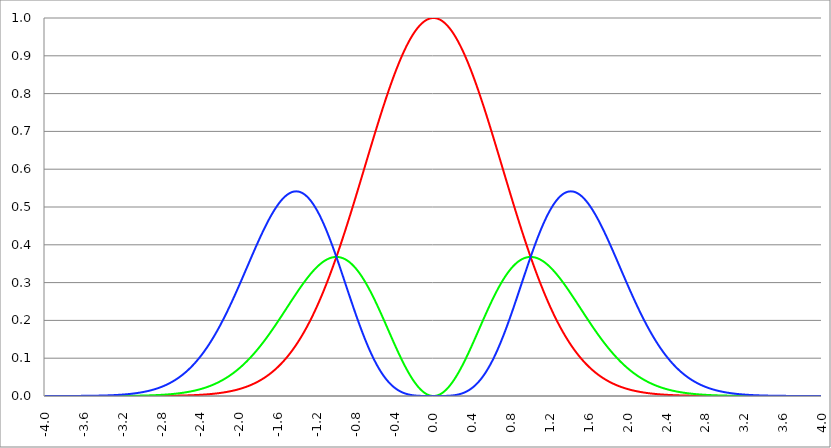
| Category | Series 1 | Series 0 | Series 2 |
|---|---|---|---|
| -4.0 | 0 | 0 | 0 |
| -3.996 | 0 | 0 | 0 |
| -3.992 | 0 | 0 | 0 |
| -3.988 | 0 | 0 | 0 |
| -3.984 | 0 | 0 | 0 |
| -3.98 | 0 | 0 | 0 |
| -3.976 | 0 | 0 | 0 |
| -3.972 | 0 | 0 | 0 |
| -3.968 | 0 | 0 | 0 |
| -3.964 | 0 | 0 | 0 |
| -3.96 | 0 | 0 | 0 |
| -3.956 | 0 | 0 | 0 |
| -3.952 | 0 | 0 | 0 |
| -3.948 | 0 | 0 | 0 |
| -3.944 | 0 | 0 | 0 |
| -3.94 | 0 | 0 | 0 |
| -3.936 | 0 | 0 | 0 |
| -3.932 | 0 | 0 | 0 |
| -3.928 | 0 | 0 | 0 |
| -3.924 | 0 | 0 | 0 |
| -3.92 | 0 | 0 | 0 |
| -3.916 | 0 | 0 | 0 |
| -3.912 | 0 | 0 | 0 |
| -3.908 | 0 | 0 | 0 |
| -3.904 | 0 | 0 | 0 |
| -3.9 | 0 | 0 | 0 |
| -3.896 | 0 | 0 | 0 |
| -3.892 | 0 | 0 | 0 |
| -3.888 | 0 | 0 | 0 |
| -3.884 | 0 | 0 | 0 |
| -3.88 | 0 | 0 | 0 |
| -3.876 | 0 | 0 | 0 |
| -3.872 | 0 | 0 | 0 |
| -3.868 | 0 | 0 | 0 |
| -3.864 | 0 | 0 | 0 |
| -3.86 | 0 | 0 | 0 |
| -3.856 | 0 | 0 | 0 |
| -3.852 | 0 | 0 | 0 |
| -3.848 | 0 | 0 | 0 |
| -3.844 | 0 | 0 | 0 |
| -3.84 | 0 | 0 | 0 |
| -3.836 | 0 | 0 | 0 |
| -3.832 | 0 | 0 | 0 |
| -3.828 | 0 | 0 | 0 |
| -3.824 | 0 | 0 | 0 |
| -3.82 | 0 | 0 | 0 |
| -3.816 | 0 | 0 | 0 |
| -3.812 | 0 | 0 | 0 |
| -3.808 | 0 | 0 | 0 |
| -3.804 | 0 | 0 | 0 |
| -3.8 | 0 | 0 | 0 |
| -3.796 | 0 | 0 | 0 |
| -3.792 | 0 | 0 | 0 |
| -3.788 | 0 | 0 | 0 |
| -3.784 | 0 | 0 | 0 |
| -3.78 | 0 | 0 | 0 |
| -3.776 | 0 | 0 | 0 |
| -3.772 | 0 | 0 | 0 |
| -3.768 | 0 | 0 | 0 |
| -3.764 | 0 | 0 | 0 |
| -3.76 | 0 | 0 | 0 |
| -3.756 | 0 | 0 | 0 |
| -3.752 | 0 | 0 | 0 |
| -3.748 | 0 | 0 | 0 |
| -3.744 | 0 | 0 | 0 |
| -3.74 | 0 | 0 | 0 |
| -3.736 | 0 | 0 | 0 |
| -3.732 | 0 | 0 | 0 |
| -3.728 | 0 | 0 | 0 |
| -3.724 | 0 | 0 | 0 |
| -3.72 | 0 | 0 | 0 |
| -3.716 | 0 | 0 | 0 |
| -3.712 | 0 | 0 | 0 |
| -3.708 | 0 | 0 | 0 |
| -3.704 | 0 | 0 | 0 |
| -3.7 | 0 | 0 | 0 |
| -3.696 | 0 | 0 | 0 |
| -3.692 | 0 | 0 | 0 |
| -3.688 | 0 | 0 | 0 |
| -3.684 | 0 | 0 | 0 |
| -3.68 | 0 | 0 | 0 |
| -3.676 | 0 | 0 | 0 |
| -3.672 | 0 | 0 | 0 |
| -3.668 | 0 | 0 | 0 |
| -3.664 | 0 | 0 | 0 |
| -3.66 | 0 | 0 | 0 |
| -3.656 | 0 | 0 | 0 |
| -3.652 | 0 | 0 | 0 |
| -3.648 | 0 | 0 | 0 |
| -3.644 | 0 | 0 | 0 |
| -3.64 | 0 | 0 | 0 |
| -3.636 | 0 | 0 | 0 |
| -3.632 | 0 | 0 | 0 |
| -3.628 | 0 | 0 | 0 |
| -3.624 | 0 | 0 | 0 |
| -3.62 | 0 | 0 | 0 |
| -3.616 | 0 | 0 | 0 |
| -3.612 | 0 | 0 | 0 |
| -3.608 | 0 | 0 | 0 |
| -3.604 | 0 | 0 | 0 |
| -3.6 | 0 | 0 | 0 |
| -3.596 | 0 | 0 | 0 |
| -3.592 | 0 | 0 | 0 |
| -3.588 | 0 | 0 | 0 |
| -3.584 | 0 | 0 | 0 |
| -3.58 | 0 | 0 | 0 |
| -3.576 | 0 | 0 | 0 |
| -3.572 | 0 | 0 | 0 |
| -3.568 | 0 | 0 | 0 |
| -3.564 | 0 | 0 | 0 |
| -3.56 | 0 | 0 | 0.001 |
| -3.556 | 0 | 0 | 0.001 |
| -3.552 | 0 | 0 | 0.001 |
| -3.548 | 0 | 0 | 0.001 |
| -3.544 | 0 | 0 | 0.001 |
| -3.54 | 0 | 0 | 0.001 |
| -3.536 | 0 | 0 | 0.001 |
| -3.532 | 0 | 0 | 0.001 |
| -3.528 | 0 | 0 | 0.001 |
| -3.524 | 0 | 0 | 0.001 |
| -3.52 | 0 | 0 | 0.001 |
| -3.516 | 0 | 0 | 0.001 |
| -3.512 | 0 | 0 | 0.001 |
| -3.508 | 0 | 0 | 0.001 |
| -3.504 | 0 | 0 | 0.001 |
| -3.5 | 0 | 0 | 0.001 |
| -3.496 | 0 | 0 | 0.001 |
| -3.492 | 0 | 0 | 0.001 |
| -3.488 | 0 | 0 | 0.001 |
| -3.484 | 0 | 0 | 0.001 |
| -3.48 | 0 | 0 | 0.001 |
| -3.476 | 0 | 0 | 0.001 |
| -3.472 | 0 | 0 | 0.001 |
| -3.467999999999999 | 0 | 0 | 0.001 |
| -3.463999999999999 | 0 | 0 | 0.001 |
| -3.459999999999999 | 0 | 0 | 0.001 |
| -3.455999999999999 | 0 | 0 | 0.001 |
| -3.451999999999999 | 0 | 0 | 0.001 |
| -3.447999999999999 | 0 | 0 | 0.001 |
| -3.443999999999999 | 0 | 0 | 0.001 |
| -3.439999999999999 | 0 | 0 | 0.001 |
| -3.435999999999999 | 0 | 0 | 0.001 |
| -3.431999999999999 | 0 | 0 | 0.001 |
| -3.427999999999999 | 0 | 0 | 0.001 |
| -3.423999999999999 | 0 | 0 | 0.001 |
| -3.419999999999999 | 0 | 0 | 0.001 |
| -3.415999999999999 | 0 | 0 | 0.001 |
| -3.411999999999999 | 0 | 0 | 0.001 |
| -3.407999999999999 | 0 | 0 | 0.001 |
| -3.403999999999999 | 0 | 0 | 0.001 |
| -3.399999999999999 | 0 | 0 | 0.001 |
| -3.395999999999999 | 0 | 0 | 0.001 |
| -3.391999999999999 | 0 | 0 | 0.001 |
| -3.387999999999999 | 0 | 0 | 0.001 |
| -3.383999999999999 | 0 | 0 | 0.001 |
| -3.379999999999999 | 0 | 0 | 0.001 |
| -3.375999999999999 | 0 | 0 | 0.001 |
| -3.371999999999999 | 0 | 0 | 0.001 |
| -3.367999999999999 | 0 | 0 | 0.002 |
| -3.363999999999999 | 0 | 0 | 0.002 |
| -3.359999999999999 | 0 | 0 | 0.002 |
| -3.355999999999999 | 0 | 0 | 0.002 |
| -3.351999999999999 | 0 | 0 | 0.002 |
| -3.347999999999999 | 0 | 0 | 0.002 |
| -3.343999999999999 | 0 | 0 | 0.002 |
| -3.339999999999999 | 0 | 0 | 0.002 |
| -3.335999999999999 | 0 | 0 | 0.002 |
| -3.331999999999999 | 0 | 0 | 0.002 |
| -3.327999999999999 | 0 | 0 | 0.002 |
| -3.323999999999999 | 0 | 0 | 0.002 |
| -3.319999999999999 | 0 | 0 | 0.002 |
| -3.315999999999999 | 0 | 0 | 0.002 |
| -3.311999999999999 | 0 | 0 | 0.002 |
| -3.307999999999999 | 0 | 0 | 0.002 |
| -3.303999999999999 | 0 | 0 | 0.002 |
| -3.299999999999999 | 0 | 0 | 0.002 |
| -3.295999999999999 | 0 | 0 | 0.002 |
| -3.291999999999999 | 0 | 0 | 0.002 |
| -3.288 | 0 | 0 | 0.002 |
| -3.284 | 0 | 0 | 0.002 |
| -3.279999999999999 | 0 | 0 | 0.002 |
| -3.275999999999999 | 0 | 0 | 0.003 |
| -3.271999999999999 | 0 | 0 | 0.003 |
| -3.268 | 0 | 0 | 0.003 |
| -3.264 | 0 | 0 | 0.003 |
| -3.259999999999999 | 0 | 0 | 0.003 |
| -3.255999999999999 | 0 | 0 | 0.003 |
| -3.251999999999999 | 0 | 0 | 0.003 |
| -3.248 | 0 | 0 | 0.003 |
| -3.244 | 0 | 0 | 0.003 |
| -3.239999999999999 | 0 | 0 | 0.003 |
| -3.235999999999999 | 0 | 0 | 0.003 |
| -3.231999999999999 | 0 | 0 | 0.003 |
| -3.228 | 0 | 0 | 0.003 |
| -3.224 | 0 | 0 | 0.003 |
| -3.219999999999999 | 0 | 0 | 0.003 |
| -3.215999999999999 | 0 | 0 | 0.003 |
| -3.211999999999999 | 0 | 0 | 0.004 |
| -3.208 | 0 | 0 | 0.004 |
| -3.204 | 0 | 0 | 0.004 |
| -3.199999999999999 | 0 | 0 | 0.004 |
| -3.195999999999999 | 0 | 0 | 0.004 |
| -3.191999999999999 | 0 | 0 | 0.004 |
| -3.188 | 0 | 0 | 0.004 |
| -3.184 | 0 | 0 | 0.004 |
| -3.179999999999999 | 0 | 0 | 0.004 |
| -3.175999999999999 | 0 | 0 | 0.004 |
| -3.171999999999999 | 0 | 0 | 0.004 |
| -3.168 | 0 | 0 | 0.004 |
| -3.164 | 0 | 0 | 0.005 |
| -3.159999999999999 | 0 | 0 | 0.005 |
| -3.155999999999999 | 0 | 0 | 0.005 |
| -3.151999999999999 | 0 | 0 | 0.005 |
| -3.148 | 0 | 0 | 0.005 |
| -3.144 | 0 | 0.001 | 0.005 |
| -3.139999999999999 | 0 | 0.001 | 0.005 |
| -3.135999999999999 | 0 | 0.001 | 0.005 |
| -3.131999999999999 | 0 | 0.001 | 0.005 |
| -3.128 | 0 | 0.001 | 0.005 |
| -3.124 | 0 | 0.001 | 0.006 |
| -3.119999999999999 | 0 | 0.001 | 0.006 |
| -3.115999999999999 | 0 | 0.001 | 0.006 |
| -3.111999999999999 | 0 | 0.001 | 0.006 |
| -3.108 | 0 | 0.001 | 0.006 |
| -3.104 | 0 | 0.001 | 0.006 |
| -3.099999999999999 | 0 | 0.001 | 0.006 |
| -3.095999999999999 | 0 | 0.001 | 0.006 |
| -3.091999999999999 | 0 | 0.001 | 0.006 |
| -3.088 | 0 | 0.001 | 0.007 |
| -3.084 | 0 | 0.001 | 0.007 |
| -3.079999999999999 | 0 | 0.001 | 0.007 |
| -3.075999999999999 | 0 | 0.001 | 0.007 |
| -3.071999999999999 | 0 | 0.001 | 0.007 |
| -3.068 | 0 | 0.001 | 0.007 |
| -3.064 | 0 | 0.001 | 0.007 |
| -3.059999999999999 | 0 | 0.001 | 0.008 |
| -3.055999999999999 | 0 | 0.001 | 0.008 |
| -3.051999999999999 | 0 | 0.001 | 0.008 |
| -3.048 | 0 | 0.001 | 0.008 |
| -3.044 | 0 | 0.001 | 0.008 |
| -3.039999999999999 | 0 | 0.001 | 0.008 |
| -3.035999999999999 | 0 | 0.001 | 0.008 |
| -3.031999999999999 | 0 | 0.001 | 0.009 |
| -3.028 | 0 | 0.001 | 0.009 |
| -3.024 | 0 | 0.001 | 0.009 |
| -3.019999999999999 | 0 | 0.001 | 0.009 |
| -3.015999999999999 | 0 | 0.001 | 0.009 |
| -3.011999999999999 | 0 | 0.001 | 0.009 |
| -3.008 | 0 | 0.001 | 0.01 |
| -3.004 | 0 | 0.001 | 0.01 |
| -2.999999999999999 | 0 | 0.001 | 0.01 |
| -2.995999999999999 | 0 | 0.001 | 0.01 |
| -2.991999999999999 | 0 | 0.001 | 0.01 |
| -2.988 | 0 | 0.001 | 0.011 |
| -2.984 | 0 | 0.001 | 0.011 |
| -2.979999999999999 | 0 | 0.001 | 0.011 |
| -2.975999999999999 | 0 | 0.001 | 0.011 |
| -2.971999999999999 | 0 | 0.001 | 0.011 |
| -2.968 | 0 | 0.001 | 0.012 |
| -2.964 | 0 | 0.001 | 0.012 |
| -2.959999999999999 | 0 | 0.001 | 0.012 |
| -2.955999999999999 | 0 | 0.001 | 0.012 |
| -2.951999999999999 | 0 | 0.001 | 0.012 |
| -2.948 | 0 | 0.001 | 0.013 |
| -2.944 | 0 | 0.001 | 0.013 |
| -2.939999999999999 | 0 | 0.002 | 0.013 |
| -2.935999999999999 | 0 | 0.002 | 0.013 |
| -2.931999999999999 | 0 | 0.002 | 0.014 |
| -2.928 | 0 | 0.002 | 0.014 |
| -2.924 | 0 | 0.002 | 0.014 |
| -2.919999999999999 | 0 | 0.002 | 0.014 |
| -2.915999999999999 | 0 | 0.002 | 0.015 |
| -2.911999999999999 | 0 | 0.002 | 0.015 |
| -2.908 | 0 | 0.002 | 0.015 |
| -2.904 | 0 | 0.002 | 0.015 |
| -2.899999999999999 | 0 | 0.002 | 0.016 |
| -2.895999999999999 | 0 | 0.002 | 0.016 |
| -2.891999999999999 | 0 | 0.002 | 0.016 |
| -2.887999999999999 | 0 | 0.002 | 0.017 |
| -2.883999999999999 | 0 | 0.002 | 0.017 |
| -2.879999999999999 | 0 | 0.002 | 0.017 |
| -2.875999999999999 | 0 | 0.002 | 0.017 |
| -2.871999999999999 | 0 | 0.002 | 0.018 |
| -2.867999999999999 | 0 | 0.002 | 0.018 |
| -2.863999999999999 | 0 | 0.002 | 0.018 |
| -2.859999999999999 | 0 | 0.002 | 0.019 |
| -2.855999999999999 | 0 | 0.002 | 0.019 |
| -2.851999999999999 | 0 | 0.002 | 0.019 |
| -2.847999999999999 | 0 | 0.002 | 0.02 |
| -2.843999999999999 | 0 | 0.002 | 0.02 |
| -2.839999999999999 | 0 | 0.003 | 0.02 |
| -2.835999999999999 | 0 | 0.003 | 0.021 |
| -2.831999999999999 | 0 | 0.003 | 0.021 |
| -2.827999999999999 | 0 | 0.003 | 0.022 |
| -2.823999999999999 | 0 | 0.003 | 0.022 |
| -2.819999999999999 | 0 | 0.003 | 0.022 |
| -2.815999999999999 | 0 | 0.003 | 0.023 |
| -2.811999999999999 | 0 | 0.003 | 0.023 |
| -2.807999999999999 | 0 | 0.003 | 0.023 |
| -2.803999999999999 | 0 | 0.003 | 0.024 |
| -2.799999999999999 | 0 | 0.003 | 0.024 |
| -2.795999999999999 | 0 | 0.003 | 0.025 |
| -2.791999999999999 | 0 | 0.003 | 0.025 |
| -2.787999999999999 | 0 | 0.003 | 0.025 |
| -2.783999999999999 | 0 | 0.003 | 0.026 |
| -2.779999999999999 | 0 | 0.003 | 0.026 |
| -2.775999999999999 | 0 | 0.003 | 0.027 |
| -2.771999999999999 | 0 | 0.004 | 0.027 |
| -2.767999999999999 | 0 | 0.004 | 0.028 |
| -2.763999999999999 | 0 | 0.004 | 0.028 |
| -2.759999999999999 | 0 | 0.004 | 0.029 |
| -2.755999999999999 | 0.001 | 0.004 | 0.029 |
| -2.751999999999999 | 0.001 | 0.004 | 0.029 |
| -2.747999999999999 | 0.001 | 0.004 | 0.03 |
| -2.743999999999999 | 0.001 | 0.004 | 0.03 |
| -2.739999999999999 | 0.001 | 0.004 | 0.031 |
| -2.735999999999999 | 0.001 | 0.004 | 0.031 |
| -2.731999999999999 | 0.001 | 0.004 | 0.032 |
| -2.727999999999999 | 0.001 | 0.004 | 0.032 |
| -2.723999999999999 | 0.001 | 0.004 | 0.033 |
| -2.719999999999999 | 0.001 | 0.005 | 0.034 |
| -2.715999999999999 | 0.001 | 0.005 | 0.034 |
| -2.711999999999999 | 0.001 | 0.005 | 0.035 |
| -2.707999999999999 | 0.001 | 0.005 | 0.035 |
| -2.703999999999999 | 0.001 | 0.005 | 0.036 |
| -2.699999999999999 | 0.001 | 0.005 | 0.036 |
| -2.695999999999999 | 0.001 | 0.005 | 0.037 |
| -2.691999999999999 | 0.001 | 0.005 | 0.037 |
| -2.687999999999999 | 0.001 | 0.005 | 0.038 |
| -2.683999999999999 | 0.001 | 0.005 | 0.039 |
| -2.679999999999999 | 0.001 | 0.005 | 0.039 |
| -2.675999999999999 | 0.001 | 0.006 | 0.04 |
| -2.671999999999999 | 0.001 | 0.006 | 0.04 |
| -2.667999999999999 | 0.001 | 0.006 | 0.041 |
| -2.663999999999999 | 0.001 | 0.006 | 0.042 |
| -2.659999999999999 | 0.001 | 0.006 | 0.042 |
| -2.655999999999999 | 0.001 | 0.006 | 0.043 |
| -2.651999999999999 | 0.001 | 0.006 | 0.044 |
| -2.647999999999999 | 0.001 | 0.006 | 0.044 |
| -2.643999999999999 | 0.001 | 0.006 | 0.045 |
| -2.639999999999999 | 0.001 | 0.007 | 0.046 |
| -2.635999999999999 | 0.001 | 0.007 | 0.046 |
| -2.631999999999999 | 0.001 | 0.007 | 0.047 |
| -2.627999999999999 | 0.001 | 0.007 | 0.048 |
| -2.623999999999999 | 0.001 | 0.007 | 0.048 |
| -2.619999999999999 | 0.001 | 0.007 | 0.049 |
| -2.615999999999999 | 0.001 | 0.007 | 0.05 |
| -2.611999999999999 | 0.001 | 0.007 | 0.051 |
| -2.607999999999999 | 0.001 | 0.008 | 0.051 |
| -2.603999999999999 | 0.001 | 0.008 | 0.052 |
| -2.599999999999999 | 0.001 | 0.008 | 0.053 |
| -2.595999999999999 | 0.001 | 0.008 | 0.054 |
| -2.591999999999999 | 0.001 | 0.008 | 0.055 |
| -2.587999999999999 | 0.001 | 0.008 | 0.055 |
| -2.583999999999999 | 0.001 | 0.008 | 0.056 |
| -2.579999999999999 | 0.001 | 0.009 | 0.057 |
| -2.575999999999999 | 0.001 | 0.009 | 0.058 |
| -2.571999999999999 | 0.001 | 0.009 | 0.059 |
| -2.567999999999999 | 0.001 | 0.009 | 0.059 |
| -2.563999999999999 | 0.001 | 0.009 | 0.06 |
| -2.559999999999999 | 0.001 | 0.009 | 0.061 |
| -2.555999999999999 | 0.001 | 0.01 | 0.062 |
| -2.551999999999999 | 0.001 | 0.01 | 0.063 |
| -2.547999999999999 | 0.002 | 0.01 | 0.064 |
| -2.543999999999999 | 0.002 | 0.01 | 0.065 |
| -2.539999999999999 | 0.002 | 0.01 | 0.066 |
| -2.535999999999999 | 0.002 | 0.01 | 0.067 |
| -2.531999999999999 | 0.002 | 0.011 | 0.068 |
| -2.527999999999999 | 0.002 | 0.011 | 0.068 |
| -2.523999999999999 | 0.002 | 0.011 | 0.069 |
| -2.519999999999999 | 0.002 | 0.011 | 0.07 |
| -2.515999999999999 | 0.002 | 0.011 | 0.071 |
| -2.511999999999999 | 0.002 | 0.011 | 0.072 |
| -2.507999999999999 | 0.002 | 0.012 | 0.073 |
| -2.503999999999999 | 0.002 | 0.012 | 0.074 |
| -2.499999999999999 | 0.002 | 0.012 | 0.075 |
| -2.495999999999999 | 0.002 | 0.012 | 0.076 |
| -2.491999999999999 | 0.002 | 0.012 | 0.077 |
| -2.487999999999999 | 0.002 | 0.013 | 0.079 |
| -2.483999999999999 | 0.002 | 0.013 | 0.08 |
| -2.479999999999999 | 0.002 | 0.013 | 0.081 |
| -2.475999999999999 | 0.002 | 0.013 | 0.082 |
| -2.471999999999999 | 0.002 | 0.014 | 0.083 |
| -2.467999999999999 | 0.002 | 0.014 | 0.084 |
| -2.463999999999999 | 0.002 | 0.014 | 0.085 |
| -2.459999999999999 | 0.002 | 0.014 | 0.086 |
| -2.455999999999999 | 0.002 | 0.014 | 0.087 |
| -2.451999999999999 | 0.002 | 0.015 | 0.089 |
| -2.447999999999999 | 0.002 | 0.015 | 0.09 |
| -2.443999999999999 | 0.003 | 0.015 | 0.091 |
| -2.439999999999999 | 0.003 | 0.015 | 0.092 |
| -2.435999999999999 | 0.003 | 0.016 | 0.093 |
| -2.431999999999999 | 0.003 | 0.016 | 0.094 |
| -2.427999999999999 | 0.003 | 0.016 | 0.096 |
| -2.423999999999999 | 0.003 | 0.016 | 0.097 |
| -2.419999999999999 | 0.003 | 0.017 | 0.098 |
| -2.415999999999999 | 0.003 | 0.017 | 0.099 |
| -2.411999999999999 | 0.003 | 0.017 | 0.101 |
| -2.407999999999999 | 0.003 | 0.018 | 0.102 |
| -2.403999999999999 | 0.003 | 0.018 | 0.103 |
| -2.399999999999999 | 0.003 | 0.018 | 0.105 |
| -2.395999999999999 | 0.003 | 0.018 | 0.106 |
| -2.391999999999999 | 0.003 | 0.019 | 0.107 |
| -2.387999999999999 | 0.003 | 0.019 | 0.109 |
| -2.383999999999999 | 0.003 | 0.019 | 0.11 |
| -2.379999999999999 | 0.003 | 0.02 | 0.111 |
| -2.375999999999999 | 0.004 | 0.02 | 0.113 |
| -2.371999999999999 | 0.004 | 0.02 | 0.114 |
| -2.367999999999998 | 0.004 | 0.021 | 0.115 |
| -2.363999999999998 | 0.004 | 0.021 | 0.117 |
| -2.359999999999998 | 0.004 | 0.021 | 0.118 |
| -2.355999999999998 | 0.004 | 0.022 | 0.12 |
| -2.351999999999998 | 0.004 | 0.022 | 0.121 |
| -2.347999999999998 | 0.004 | 0.022 | 0.123 |
| -2.343999999999998 | 0.004 | 0.023 | 0.124 |
| -2.339999999999998 | 0.004 | 0.023 | 0.126 |
| -2.335999999999998 | 0.004 | 0.023 | 0.127 |
| -2.331999999999998 | 0.004 | 0.024 | 0.129 |
| -2.327999999999998 | 0.004 | 0.024 | 0.13 |
| -2.323999999999998 | 0.005 | 0.024 | 0.132 |
| -2.319999999999998 | 0.005 | 0.025 | 0.133 |
| -2.315999999999998 | 0.005 | 0.025 | 0.135 |
| -2.311999999999998 | 0.005 | 0.025 | 0.136 |
| -2.307999999999998 | 0.005 | 0.026 | 0.138 |
| -2.303999999999998 | 0.005 | 0.026 | 0.139 |
| -2.299999999999998 | 0.005 | 0.027 | 0.141 |
| -2.295999999999998 | 0.005 | 0.027 | 0.143 |
| -2.291999999999998 | 0.005 | 0.027 | 0.144 |
| -2.287999999999998 | 0.005 | 0.028 | 0.146 |
| -2.283999999999998 | 0.005 | 0.028 | 0.148 |
| -2.279999999999998 | 0.006 | 0.029 | 0.149 |
| -2.275999999999998 | 0.006 | 0.029 | 0.151 |
| -2.271999999999998 | 0.006 | 0.03 | 0.153 |
| -2.267999999999998 | 0.006 | 0.03 | 0.154 |
| -2.263999999999998 | 0.006 | 0.03 | 0.156 |
| -2.259999999999998 | 0.006 | 0.031 | 0.158 |
| -2.255999999999998 | 0.006 | 0.031 | 0.16 |
| -2.251999999999998 | 0.006 | 0.032 | 0.161 |
| -2.247999999999998 | 0.006 | 0.032 | 0.163 |
| -2.243999999999998 | 0.007 | 0.033 | 0.165 |
| -2.239999999999998 | 0.007 | 0.033 | 0.167 |
| -2.235999999999998 | 0.007 | 0.034 | 0.168 |
| -2.231999999999998 | 0.007 | 0.034 | 0.17 |
| -2.227999999999998 | 0.007 | 0.035 | 0.172 |
| -2.223999999999998 | 0.007 | 0.035 | 0.174 |
| -2.219999999999998 | 0.007 | 0.036 | 0.176 |
| -2.215999999999998 | 0.007 | 0.036 | 0.178 |
| -2.211999999999998 | 0.007 | 0.037 | 0.18 |
| -2.207999999999998 | 0.008 | 0.037 | 0.181 |
| -2.203999999999998 | 0.008 | 0.038 | 0.183 |
| -2.199999999999998 | 0.008 | 0.038 | 0.185 |
| -2.195999999999998 | 0.008 | 0.039 | 0.187 |
| -2.191999999999998 | 0.008 | 0.039 | 0.189 |
| -2.187999999999998 | 0.008 | 0.04 | 0.191 |
| -2.183999999999998 | 0.008 | 0.04 | 0.193 |
| -2.179999999999998 | 0.009 | 0.041 | 0.195 |
| -2.175999999999998 | 0.009 | 0.042 | 0.197 |
| -2.171999999999998 | 0.009 | 0.042 | 0.199 |
| -2.167999999999998 | 0.009 | 0.043 | 0.201 |
| -2.163999999999998 | 0.009 | 0.043 | 0.203 |
| -2.159999999999998 | 0.009 | 0.044 | 0.205 |
| -2.155999999999998 | 0.01 | 0.045 | 0.207 |
| -2.151999999999998 | 0.01 | 0.045 | 0.209 |
| -2.147999999999998 | 0.01 | 0.046 | 0.211 |
| -2.143999999999998 | 0.01 | 0.046 | 0.213 |
| -2.139999999999998 | 0.01 | 0.047 | 0.215 |
| -2.135999999999998 | 0.01 | 0.048 | 0.217 |
| -2.131999999999998 | 0.011 | 0.048 | 0.219 |
| -2.127999999999998 | 0.011 | 0.049 | 0.221 |
| -2.123999999999998 | 0.011 | 0.05 | 0.224 |
| -2.119999999999998 | 0.011 | 0.05 | 0.226 |
| -2.115999999999998 | 0.011 | 0.051 | 0.228 |
| -2.111999999999998 | 0.012 | 0.052 | 0.23 |
| -2.107999999999998 | 0.012 | 0.052 | 0.232 |
| -2.103999999999998 | 0.012 | 0.053 | 0.234 |
| -2.099999999999998 | 0.012 | 0.054 | 0.236 |
| -2.095999999999998 | 0.012 | 0.054 | 0.239 |
| -2.091999999999998 | 0.013 | 0.055 | 0.241 |
| -2.087999999999998 | 0.013 | 0.056 | 0.243 |
| -2.083999999999998 | 0.013 | 0.056 | 0.245 |
| -2.079999999999998 | 0.013 | 0.057 | 0.247 |
| -2.075999999999998 | 0.013 | 0.058 | 0.25 |
| -2.071999999999998 | 0.014 | 0.059 | 0.252 |
| -2.067999999999998 | 0.014 | 0.059 | 0.254 |
| -2.063999999999998 | 0.014 | 0.06 | 0.256 |
| -2.059999999999998 | 0.014 | 0.061 | 0.259 |
| -2.055999999999998 | 0.015 | 0.062 | 0.261 |
| -2.051999999999998 | 0.015 | 0.062 | 0.263 |
| -2.047999999999998 | 0.015 | 0.063 | 0.265 |
| -2.043999999999998 | 0.015 | 0.064 | 0.268 |
| -2.039999999999998 | 0.016 | 0.065 | 0.27 |
| -2.035999999999998 | 0.016 | 0.066 | 0.272 |
| -2.031999999999998 | 0.016 | 0.066 | 0.274 |
| -2.027999999999998 | 0.016 | 0.067 | 0.277 |
| -2.023999999999998 | 0.017 | 0.068 | 0.279 |
| -2.019999999999998 | 0.017 | 0.069 | 0.281 |
| -2.015999999999998 | 0.017 | 0.07 | 0.284 |
| -2.011999999999998 | 0.017 | 0.071 | 0.286 |
| -2.007999999999998 | 0.018 | 0.072 | 0.288 |
| -2.003999999999998 | 0.018 | 0.072 | 0.291 |
| -1.999999999999998 | 0.018 | 0.073 | 0.293 |
| -1.995999999999998 | 0.019 | 0.074 | 0.295 |
| -1.991999999999998 | 0.019 | 0.075 | 0.298 |
| -1.987999999999998 | 0.019 | 0.076 | 0.3 |
| -1.983999999999998 | 0.02 | 0.077 | 0.302 |
| -1.979999999999998 | 0.02 | 0.078 | 0.305 |
| -1.975999999999998 | 0.02 | 0.079 | 0.307 |
| -1.971999999999998 | 0.02 | 0.08 | 0.31 |
| -1.967999999999998 | 0.021 | 0.081 | 0.312 |
| -1.963999999999998 | 0.021 | 0.081 | 0.314 |
| -1.959999999999998 | 0.021 | 0.082 | 0.317 |
| -1.955999999999998 | 0.022 | 0.083 | 0.319 |
| -1.951999999999998 | 0.022 | 0.084 | 0.321 |
| -1.947999999999998 | 0.022 | 0.085 | 0.324 |
| -1.943999999999998 | 0.023 | 0.086 | 0.326 |
| -1.939999999999998 | 0.023 | 0.087 | 0.329 |
| -1.935999999999998 | 0.024 | 0.088 | 0.331 |
| -1.931999999999998 | 0.024 | 0.089 | 0.333 |
| -1.927999999999998 | 0.024 | 0.09 | 0.336 |
| -1.923999999999998 | 0.025 | 0.091 | 0.338 |
| -1.919999999999998 | 0.025 | 0.092 | 0.341 |
| -1.915999999999998 | 0.025 | 0.093 | 0.343 |
| -1.911999999999998 | 0.026 | 0.094 | 0.345 |
| -1.907999999999998 | 0.026 | 0.096 | 0.348 |
| -1.903999999999998 | 0.027 | 0.097 | 0.35 |
| -1.899999999999998 | 0.027 | 0.098 | 0.353 |
| -1.895999999999998 | 0.027 | 0.099 | 0.355 |
| -1.891999999999998 | 0.028 | 0.1 | 0.357 |
| -1.887999999999998 | 0.028 | 0.101 | 0.36 |
| -1.883999999999998 | 0.029 | 0.102 | 0.362 |
| -1.879999999999998 | 0.029 | 0.103 | 0.364 |
| -1.875999999999998 | 0.03 | 0.104 | 0.367 |
| -1.871999999999998 | 0.03 | 0.105 | 0.369 |
| -1.867999999999998 | 0.031 | 0.106 | 0.372 |
| -1.863999999999998 | 0.031 | 0.108 | 0.374 |
| -1.859999999999998 | 0.031 | 0.109 | 0.376 |
| -1.855999999999998 | 0.032 | 0.11 | 0.379 |
| -1.851999999999998 | 0.032 | 0.111 | 0.381 |
| -1.847999999999998 | 0.033 | 0.112 | 0.383 |
| -1.843999999999998 | 0.033 | 0.113 | 0.386 |
| -1.839999999999998 | 0.034 | 0.115 | 0.388 |
| -1.835999999999998 | 0.034 | 0.116 | 0.39 |
| -1.831999999999998 | 0.035 | 0.117 | 0.393 |
| -1.827999999999998 | 0.035 | 0.118 | 0.395 |
| -1.823999999999998 | 0.036 | 0.119 | 0.397 |
| -1.819999999999998 | 0.036 | 0.121 | 0.4 |
| -1.815999999999998 | 0.037 | 0.122 | 0.402 |
| -1.811999999999998 | 0.038 | 0.123 | 0.404 |
| -1.807999999999998 | 0.038 | 0.124 | 0.407 |
| -1.803999999999998 | 0.039 | 0.126 | 0.409 |
| -1.799999999999998 | 0.039 | 0.127 | 0.411 |
| -1.795999999999998 | 0.04 | 0.128 | 0.413 |
| -1.791999999999998 | 0.04 | 0.129 | 0.416 |
| -1.787999999999998 | 0.041 | 0.131 | 0.418 |
| -1.783999999999998 | 0.041 | 0.132 | 0.42 |
| -1.779999999999998 | 0.042 | 0.133 | 0.422 |
| -1.775999999999998 | 0.043 | 0.135 | 0.425 |
| -1.771999999999998 | 0.043 | 0.136 | 0.427 |
| -1.767999999999998 | 0.044 | 0.137 | 0.429 |
| -1.763999999999998 | 0.045 | 0.139 | 0.431 |
| -1.759999999999998 | 0.045 | 0.14 | 0.433 |
| -1.755999999999998 | 0.046 | 0.141 | 0.435 |
| -1.751999999999998 | 0.046 | 0.143 | 0.438 |
| -1.747999999999998 | 0.047 | 0.144 | 0.44 |
| -1.743999999999998 | 0.048 | 0.145 | 0.442 |
| -1.739999999999998 | 0.048 | 0.147 | 0.444 |
| -1.735999999999998 | 0.049 | 0.148 | 0.446 |
| -1.731999999999998 | 0.05 | 0.149 | 0.448 |
| -1.727999999999998 | 0.05 | 0.151 | 0.45 |
| -1.723999999999998 | 0.051 | 0.152 | 0.452 |
| -1.719999999999998 | 0.052 | 0.154 | 0.454 |
| -1.715999999999998 | 0.053 | 0.155 | 0.456 |
| -1.711999999999998 | 0.053 | 0.156 | 0.458 |
| -1.707999999999998 | 0.054 | 0.158 | 0.46 |
| -1.703999999999998 | 0.055 | 0.159 | 0.462 |
| -1.699999999999998 | 0.056 | 0.161 | 0.464 |
| -1.695999999999998 | 0.056 | 0.162 | 0.466 |
| -1.691999999999998 | 0.057 | 0.163 | 0.468 |
| -1.687999999999998 | 0.058 | 0.165 | 0.47 |
| -1.683999999999998 | 0.059 | 0.166 | 0.472 |
| -1.679999999999998 | 0.059 | 0.168 | 0.474 |
| -1.675999999999998 | 0.06 | 0.169 | 0.476 |
| -1.671999999999998 | 0.061 | 0.171 | 0.477 |
| -1.667999999999998 | 0.062 | 0.172 | 0.479 |
| -1.663999999999998 | 0.063 | 0.174 | 0.481 |
| -1.659999999999998 | 0.064 | 0.175 | 0.483 |
| -1.655999999999998 | 0.064 | 0.177 | 0.484 |
| -1.651999999999998 | 0.065 | 0.178 | 0.486 |
| -1.647999999999998 | 0.066 | 0.18 | 0.488 |
| -1.643999999999998 | 0.067 | 0.181 | 0.49 |
| -1.639999999999998 | 0.068 | 0.183 | 0.491 |
| -1.635999999999998 | 0.069 | 0.184 | 0.493 |
| -1.631999999999998 | 0.07 | 0.186 | 0.495 |
| -1.627999999999998 | 0.071 | 0.187 | 0.496 |
| -1.623999999999998 | 0.072 | 0.189 | 0.498 |
| -1.619999999999998 | 0.072 | 0.19 | 0.499 |
| -1.615999999999998 | 0.073 | 0.192 | 0.501 |
| -1.611999999999998 | 0.074 | 0.193 | 0.502 |
| -1.607999999999998 | 0.075 | 0.195 | 0.504 |
| -1.603999999999998 | 0.076 | 0.196 | 0.505 |
| -1.599999999999998 | 0.077 | 0.198 | 0.507 |
| -1.595999999999998 | 0.078 | 0.199 | 0.508 |
| -1.591999999999998 | 0.079 | 0.201 | 0.509 |
| -1.587999999999998 | 0.08 | 0.203 | 0.511 |
| -1.583999999999998 | 0.081 | 0.204 | 0.512 |
| -1.579999999999998 | 0.082 | 0.206 | 0.513 |
| -1.575999999999998 | 0.083 | 0.207 | 0.515 |
| -1.571999999999998 | 0.084 | 0.209 | 0.516 |
| -1.567999999999998 | 0.086 | 0.21 | 0.517 |
| -1.563999999999998 | 0.087 | 0.212 | 0.518 |
| -1.559999999999998 | 0.088 | 0.213 | 0.52 |
| -1.555999999999998 | 0.089 | 0.215 | 0.521 |
| -1.551999999999998 | 0.09 | 0.217 | 0.522 |
| -1.547999999999998 | 0.091 | 0.218 | 0.523 |
| -1.543999999999998 | 0.092 | 0.22 | 0.524 |
| -1.539999999999998 | 0.093 | 0.221 | 0.525 |
| -1.535999999999998 | 0.094 | 0.223 | 0.526 |
| -1.531999999999998 | 0.096 | 0.225 | 0.527 |
| -1.527999999999998 | 0.097 | 0.226 | 0.528 |
| -1.523999999999998 | 0.098 | 0.228 | 0.529 |
| -1.519999999999998 | 0.099 | 0.229 | 0.53 |
| -1.515999999999998 | 0.1 | 0.231 | 0.53 |
| -1.511999999999998 | 0.102 | 0.232 | 0.531 |
| -1.507999999999998 | 0.103 | 0.234 | 0.532 |
| -1.503999999999998 | 0.104 | 0.236 | 0.533 |
| -1.499999999999998 | 0.105 | 0.237 | 0.534 |
| -1.495999999999998 | 0.107 | 0.239 | 0.534 |
| -1.491999999999998 | 0.108 | 0.24 | 0.535 |
| -1.487999999999998 | 0.109 | 0.242 | 0.536 |
| -1.483999999999998 | 0.111 | 0.243 | 0.536 |
| -1.479999999999998 | 0.112 | 0.245 | 0.537 |
| -1.475999999999998 | 0.113 | 0.247 | 0.537 |
| -1.471999999999998 | 0.115 | 0.248 | 0.538 |
| -1.467999999999998 | 0.116 | 0.25 | 0.538 |
| -1.463999999999998 | 0.117 | 0.251 | 0.539 |
| -1.459999999999998 | 0.119 | 0.253 | 0.539 |
| -1.455999999999998 | 0.12 | 0.254 | 0.539 |
| -1.451999999999998 | 0.121 | 0.256 | 0.54 |
| -1.447999999999998 | 0.123 | 0.258 | 0.54 |
| -1.443999999999998 | 0.124 | 0.259 | 0.54 |
| -1.439999999999998 | 0.126 | 0.261 | 0.541 |
| -1.435999999999998 | 0.127 | 0.262 | 0.541 |
| -1.431999999999998 | 0.129 | 0.264 | 0.541 |
| -1.427999999999998 | 0.13 | 0.265 | 0.541 |
| -1.423999999999998 | 0.132 | 0.267 | 0.541 |
| -1.419999999999998 | 0.133 | 0.268 | 0.541 |
| -1.415999999999998 | 0.135 | 0.27 | 0.541 |
| -1.411999999999998 | 0.136 | 0.272 | 0.541 |
| -1.407999999999998 | 0.138 | 0.273 | 0.541 |
| -1.403999999999998 | 0.139 | 0.275 | 0.541 |
| -1.399999999999998 | 0.141 | 0.276 | 0.541 |
| -1.395999999999998 | 0.142 | 0.278 | 0.541 |
| -1.391999999999998 | 0.144 | 0.279 | 0.541 |
| -1.387999999999998 | 0.146 | 0.281 | 0.541 |
| -1.383999999999998 | 0.147 | 0.282 | 0.54 |
| -1.379999999999998 | 0.149 | 0.284 | 0.54 |
| -1.375999999999998 | 0.151 | 0.285 | 0.54 |
| -1.371999999999998 | 0.152 | 0.287 | 0.539 |
| -1.367999999999998 | 0.154 | 0.288 | 0.539 |
| -1.363999999999998 | 0.156 | 0.289 | 0.539 |
| -1.359999999999998 | 0.157 | 0.291 | 0.538 |
| -1.355999999999998 | 0.159 | 0.292 | 0.538 |
| -1.351999999999998 | 0.161 | 0.294 | 0.537 |
| -1.347999999999998 | 0.162 | 0.295 | 0.537 |
| -1.343999999999998 | 0.164 | 0.297 | 0.536 |
| -1.339999999999998 | 0.166 | 0.298 | 0.535 |
| -1.335999999999998 | 0.168 | 0.3 | 0.535 |
| -1.331999999999998 | 0.17 | 0.301 | 0.534 |
| -1.327999999999998 | 0.171 | 0.302 | 0.533 |
| -1.323999999999998 | 0.173 | 0.304 | 0.532 |
| -1.319999999999998 | 0.175 | 0.305 | 0.532 |
| -1.315999999999998 | 0.177 | 0.306 | 0.531 |
| -1.311999999999998 | 0.179 | 0.308 | 0.53 |
| -1.307999999999998 | 0.181 | 0.309 | 0.529 |
| -1.303999999999998 | 0.183 | 0.311 | 0.528 |
| -1.299999999999998 | 0.185 | 0.312 | 0.527 |
| -1.295999999999998 | 0.186 | 0.313 | 0.526 |
| -1.291999999999998 | 0.188 | 0.314 | 0.525 |
| -1.287999999999998 | 0.19 | 0.316 | 0.524 |
| -1.283999999999998 | 0.192 | 0.317 | 0.523 |
| -1.279999999999998 | 0.194 | 0.318 | 0.522 |
| -1.275999999999998 | 0.196 | 0.32 | 0.52 |
| -1.271999999999998 | 0.198 | 0.321 | 0.519 |
| -1.267999999999998 | 0.2 | 0.322 | 0.518 |
| -1.263999999999998 | 0.202 | 0.323 | 0.517 |
| -1.259999999999998 | 0.204 | 0.325 | 0.515 |
| -1.255999999999998 | 0.206 | 0.326 | 0.514 |
| -1.251999999999998 | 0.209 | 0.327 | 0.512 |
| -1.247999999999998 | 0.211 | 0.328 | 0.511 |
| -1.243999999999998 | 0.213 | 0.329 | 0.51 |
| -1.239999999999998 | 0.215 | 0.33 | 0.508 |
| -1.235999999999998 | 0.217 | 0.332 | 0.507 |
| -1.231999999999998 | 0.219 | 0.333 | 0.505 |
| -1.227999999999998 | 0.221 | 0.334 | 0.503 |
| -1.223999999999998 | 0.224 | 0.335 | 0.502 |
| -1.219999999999998 | 0.226 | 0.336 | 0.5 |
| -1.215999999999998 | 0.228 | 0.337 | 0.498 |
| -1.211999999999998 | 0.23 | 0.338 | 0.497 |
| -1.207999999999998 | 0.232 | 0.339 | 0.495 |
| -1.203999999999998 | 0.235 | 0.34 | 0.493 |
| -1.199999999999997 | 0.237 | 0.341 | 0.491 |
| -1.195999999999997 | 0.239 | 0.342 | 0.489 |
| -1.191999999999997 | 0.242 | 0.343 | 0.488 |
| -1.187999999999997 | 0.244 | 0.344 | 0.486 |
| -1.183999999999997 | 0.246 | 0.345 | 0.484 |
| -1.179999999999997 | 0.248 | 0.346 | 0.482 |
| -1.175999999999997 | 0.251 | 0.347 | 0.48 |
| -1.171999999999997 | 0.253 | 0.348 | 0.478 |
| -1.167999999999997 | 0.256 | 0.349 | 0.476 |
| -1.163999999999997 | 0.258 | 0.35 | 0.474 |
| -1.159999999999997 | 0.26 | 0.35 | 0.471 |
| -1.155999999999997 | 0.263 | 0.351 | 0.469 |
| -1.151999999999997 | 0.265 | 0.352 | 0.467 |
| -1.147999999999997 | 0.268 | 0.353 | 0.465 |
| -1.143999999999997 | 0.27 | 0.354 | 0.463 |
| -1.139999999999997 | 0.273 | 0.354 | 0.46 |
| -1.135999999999997 | 0.275 | 0.355 | 0.458 |
| -1.131999999999997 | 0.278 | 0.356 | 0.456 |
| -1.127999999999997 | 0.28 | 0.356 | 0.454 |
| -1.123999999999997 | 0.283 | 0.357 | 0.451 |
| -1.119999999999997 | 0.285 | 0.358 | 0.449 |
| -1.115999999999997 | 0.288 | 0.358 | 0.446 |
| -1.111999999999997 | 0.29 | 0.359 | 0.444 |
| -1.107999999999997 | 0.293 | 0.36 | 0.442 |
| -1.103999999999997 | 0.296 | 0.36 | 0.439 |
| -1.099999999999997 | 0.298 | 0.361 | 0.437 |
| -1.095999999999997 | 0.301 | 0.361 | 0.434 |
| -1.091999999999997 | 0.303 | 0.362 | 0.432 |
| -1.087999999999997 | 0.306 | 0.362 | 0.429 |
| -1.083999999999997 | 0.309 | 0.363 | 0.426 |
| -1.079999999999997 | 0.311 | 0.363 | 0.424 |
| -1.075999999999997 | 0.314 | 0.364 | 0.421 |
| -1.071999999999997 | 0.317 | 0.364 | 0.418 |
| -1.067999999999997 | 0.32 | 0.365 | 0.416 |
| -1.063999999999997 | 0.322 | 0.365 | 0.413 |
| -1.059999999999997 | 0.325 | 0.365 | 0.41 |
| -1.055999999999997 | 0.328 | 0.366 | 0.408 |
| -1.051999999999997 | 0.331 | 0.366 | 0.405 |
| -1.047999999999997 | 0.333 | 0.366 | 0.402 |
| -1.043999999999997 | 0.336 | 0.366 | 0.399 |
| -1.039999999999997 | 0.339 | 0.367 | 0.397 |
| -1.035999999999997 | 0.342 | 0.367 | 0.394 |
| -1.031999999999997 | 0.345 | 0.367 | 0.391 |
| -1.027999999999997 | 0.348 | 0.367 | 0.388 |
| -1.023999999999997 | 0.35 | 0.367 | 0.385 |
| -1.019999999999997 | 0.353 | 0.368 | 0.382 |
| -1.015999999999997 | 0.356 | 0.368 | 0.38 |
| -1.011999999999997 | 0.359 | 0.368 | 0.377 |
| -1.007999999999997 | 0.362 | 0.368 | 0.374 |
| -1.003999999999997 | 0.365 | 0.368 | 0.371 |
| -0.999999999999997 | 0.368 | 0.368 | 0.368 |
| -0.995999999999997 | 0.371 | 0.368 | 0.365 |
| -0.991999999999997 | 0.374 | 0.368 | 0.362 |
| -0.987999999999997 | 0.377 | 0.368 | 0.359 |
| -0.983999999999997 | 0.38 | 0.368 | 0.356 |
| -0.979999999999997 | 0.383 | 0.368 | 0.353 |
| -0.975999999999997 | 0.386 | 0.367 | 0.35 |
| -0.971999999999997 | 0.389 | 0.367 | 0.347 |
| -0.967999999999997 | 0.392 | 0.367 | 0.344 |
| -0.963999999999997 | 0.395 | 0.367 | 0.341 |
| -0.959999999999997 | 0.398 | 0.367 | 0.338 |
| -0.955999999999997 | 0.401 | 0.366 | 0.335 |
| -0.951999999999997 | 0.404 | 0.366 | 0.332 |
| -0.947999999999997 | 0.407 | 0.366 | 0.329 |
| -0.943999999999997 | 0.41 | 0.366 | 0.326 |
| -0.939999999999997 | 0.413 | 0.365 | 0.323 |
| -0.935999999999997 | 0.416 | 0.365 | 0.32 |
| -0.931999999999997 | 0.42 | 0.364 | 0.317 |
| -0.927999999999997 | 0.423 | 0.364 | 0.313 |
| -0.923999999999997 | 0.426 | 0.364 | 0.31 |
| -0.919999999999997 | 0.429 | 0.363 | 0.307 |
| -0.915999999999997 | 0.432 | 0.363 | 0.304 |
| -0.911999999999997 | 0.435 | 0.362 | 0.301 |
| -0.907999999999997 | 0.438 | 0.362 | 0.298 |
| -0.903999999999997 | 0.442 | 0.361 | 0.295 |
| -0.899999999999997 | 0.445 | 0.36 | 0.292 |
| -0.895999999999997 | 0.448 | 0.36 | 0.289 |
| -0.891999999999997 | 0.451 | 0.359 | 0.286 |
| -0.887999999999997 | 0.455 | 0.358 | 0.283 |
| -0.883999999999997 | 0.458 | 0.358 | 0.28 |
| -0.879999999999997 | 0.461 | 0.357 | 0.276 |
| -0.875999999999997 | 0.464 | 0.356 | 0.273 |
| -0.871999999999997 | 0.467 | 0.355 | 0.27 |
| -0.867999999999997 | 0.471 | 0.355 | 0.267 |
| -0.863999999999997 | 0.474 | 0.354 | 0.264 |
| -0.859999999999997 | 0.477 | 0.353 | 0.261 |
| -0.855999999999997 | 0.481 | 0.352 | 0.258 |
| -0.851999999999997 | 0.484 | 0.351 | 0.255 |
| -0.847999999999997 | 0.487 | 0.35 | 0.252 |
| -0.843999999999997 | 0.49 | 0.349 | 0.249 |
| -0.839999999999997 | 0.494 | 0.348 | 0.246 |
| -0.835999999999997 | 0.497 | 0.347 | 0.243 |
| -0.831999999999997 | 0.5 | 0.346 | 0.24 |
| -0.827999999999997 | 0.504 | 0.345 | 0.237 |
| -0.823999999999997 | 0.507 | 0.344 | 0.234 |
| -0.819999999999997 | 0.51 | 0.343 | 0.231 |
| -0.815999999999997 | 0.514 | 0.342 | 0.228 |
| -0.811999999999997 | 0.517 | 0.341 | 0.225 |
| -0.807999999999997 | 0.521 | 0.34 | 0.222 |
| -0.803999999999997 | 0.524 | 0.339 | 0.219 |
| -0.799999999999997 | 0.527 | 0.337 | 0.216 |
| -0.795999999999997 | 0.531 | 0.336 | 0.213 |
| -0.791999999999997 | 0.534 | 0.335 | 0.21 |
| -0.787999999999997 | 0.537 | 0.334 | 0.207 |
| -0.783999999999997 | 0.541 | 0.332 | 0.204 |
| -0.779999999999997 | 0.544 | 0.331 | 0.201 |
| -0.775999999999997 | 0.548 | 0.33 | 0.199 |
| -0.771999999999997 | 0.551 | 0.328 | 0.196 |
| -0.767999999999997 | 0.554 | 0.327 | 0.193 |
| -0.763999999999997 | 0.558 | 0.326 | 0.19 |
| -0.759999999999997 | 0.561 | 0.324 | 0.187 |
| -0.755999999999997 | 0.565 | 0.323 | 0.184 |
| -0.751999999999997 | 0.568 | 0.321 | 0.182 |
| -0.747999999999997 | 0.571 | 0.32 | 0.179 |
| -0.743999999999997 | 0.575 | 0.318 | 0.176 |
| -0.739999999999997 | 0.578 | 0.317 | 0.173 |
| -0.735999999999997 | 0.582 | 0.315 | 0.171 |
| -0.731999999999997 | 0.585 | 0.314 | 0.168 |
| -0.727999999999997 | 0.589 | 0.312 | 0.165 |
| -0.723999999999997 | 0.592 | 0.31 | 0.163 |
| -0.719999999999997 | 0.595 | 0.309 | 0.16 |
| -0.715999999999997 | 0.599 | 0.307 | 0.157 |
| -0.711999999999997 | 0.602 | 0.305 | 0.155 |
| -0.707999999999997 | 0.606 | 0.304 | 0.152 |
| -0.703999999999997 | 0.609 | 0.302 | 0.15 |
| -0.699999999999997 | 0.613 | 0.3 | 0.147 |
| -0.695999999999997 | 0.616 | 0.298 | 0.145 |
| -0.691999999999997 | 0.619 | 0.297 | 0.142 |
| -0.687999999999997 | 0.623 | 0.295 | 0.14 |
| -0.683999999999997 | 0.626 | 0.293 | 0.137 |
| -0.679999999999997 | 0.63 | 0.291 | 0.135 |
| -0.675999999999997 | 0.633 | 0.289 | 0.132 |
| -0.671999999999997 | 0.637 | 0.287 | 0.13 |
| -0.667999999999997 | 0.64 | 0.286 | 0.127 |
| -0.663999999999997 | 0.643 | 0.284 | 0.125 |
| -0.659999999999997 | 0.647 | 0.282 | 0.123 |
| -0.655999999999997 | 0.65 | 0.28 | 0.12 |
| -0.651999999999997 | 0.654 | 0.278 | 0.118 |
| -0.647999999999997 | 0.657 | 0.276 | 0.116 |
| -0.643999999999997 | 0.661 | 0.274 | 0.114 |
| -0.639999999999997 | 0.664 | 0.272 | 0.111 |
| -0.635999999999997 | 0.667 | 0.27 | 0.109 |
| -0.631999999999997 | 0.671 | 0.268 | 0.107 |
| -0.627999999999997 | 0.674 | 0.266 | 0.105 |
| -0.623999999999997 | 0.677 | 0.264 | 0.103 |
| -0.619999999999997 | 0.681 | 0.262 | 0.101 |
| -0.615999999999997 | 0.684 | 0.26 | 0.099 |
| -0.611999999999997 | 0.688 | 0.258 | 0.096 |
| -0.607999999999997 | 0.691 | 0.255 | 0.094 |
| -0.603999999999997 | 0.694 | 0.253 | 0.092 |
| -0.599999999999997 | 0.698 | 0.251 | 0.09 |
| -0.595999999999997 | 0.701 | 0.249 | 0.088 |
| -0.591999999999997 | 0.704 | 0.247 | 0.087 |
| -0.587999999999997 | 0.708 | 0.245 | 0.085 |
| -0.583999999999997 | 0.711 | 0.242 | 0.083 |
| -0.579999999999997 | 0.714 | 0.24 | 0.081 |
| -0.575999999999997 | 0.718 | 0.238 | 0.079 |
| -0.571999999999997 | 0.721 | 0.236 | 0.077 |
| -0.567999999999997 | 0.724 | 0.234 | 0.075 |
| -0.563999999999997 | 0.728 | 0.231 | 0.074 |
| -0.559999999999997 | 0.731 | 0.229 | 0.072 |
| -0.555999999999997 | 0.734 | 0.227 | 0.07 |
| -0.551999999999997 | 0.737 | 0.225 | 0.068 |
| -0.547999999999997 | 0.741 | 0.222 | 0.067 |
| -0.543999999999997 | 0.744 | 0.22 | 0.065 |
| -0.539999999999997 | 0.747 | 0.218 | 0.064 |
| -0.535999999999997 | 0.75 | 0.216 | 0.062 |
| -0.531999999999997 | 0.754 | 0.213 | 0.06 |
| -0.527999999999997 | 0.757 | 0.211 | 0.059 |
| -0.523999999999997 | 0.76 | 0.209 | 0.057 |
| -0.519999999999997 | 0.763 | 0.206 | 0.056 |
| -0.515999999999997 | 0.766 | 0.204 | 0.054 |
| -0.511999999999997 | 0.769 | 0.202 | 0.053 |
| -0.507999999999997 | 0.773 | 0.199 | 0.051 |
| -0.503999999999997 | 0.776 | 0.197 | 0.05 |
| -0.499999999999997 | 0.779 | 0.195 | 0.049 |
| -0.495999999999997 | 0.782 | 0.192 | 0.047 |
| -0.491999999999997 | 0.785 | 0.19 | 0.046 |
| -0.487999999999997 | 0.788 | 0.188 | 0.045 |
| -0.483999999999997 | 0.791 | 0.185 | 0.043 |
| -0.479999999999997 | 0.794 | 0.183 | 0.042 |
| -0.475999999999997 | 0.797 | 0.181 | 0.041 |
| -0.471999999999997 | 0.8 | 0.178 | 0.04 |
| -0.467999999999997 | 0.803 | 0.176 | 0.039 |
| -0.463999999999997 | 0.806 | 0.174 | 0.037 |
| -0.459999999999997 | 0.809 | 0.171 | 0.036 |
| -0.455999999999997 | 0.812 | 0.169 | 0.035 |
| -0.451999999999997 | 0.815 | 0.167 | 0.034 |
| -0.447999999999997 | 0.818 | 0.164 | 0.033 |
| -0.443999999999997 | 0.821 | 0.162 | 0.032 |
| -0.439999999999997 | 0.824 | 0.16 | 0.031 |
| -0.435999999999997 | 0.827 | 0.157 | 0.03 |
| -0.431999999999997 | 0.83 | 0.155 | 0.029 |
| -0.427999999999997 | 0.833 | 0.153 | 0.028 |
| -0.423999999999997 | 0.835 | 0.15 | 0.027 |
| -0.419999999999997 | 0.838 | 0.148 | 0.026 |
| -0.415999999999997 | 0.841 | 0.146 | 0.025 |
| -0.411999999999997 | 0.844 | 0.143 | 0.024 |
| -0.407999999999997 | 0.847 | 0.141 | 0.023 |
| -0.403999999999997 | 0.849 | 0.139 | 0.023 |
| -0.399999999999997 | 0.852 | 0.136 | 0.022 |
| -0.395999999999997 | 0.855 | 0.134 | 0.021 |
| -0.391999999999997 | 0.858 | 0.132 | 0.02 |
| -0.387999999999997 | 0.86 | 0.13 | 0.019 |
| -0.383999999999997 | 0.863 | 0.127 | 0.019 |
| -0.379999999999997 | 0.866 | 0.125 | 0.018 |
| -0.375999999999997 | 0.868 | 0.123 | 0.017 |
| -0.371999999999997 | 0.871 | 0.12 | 0.017 |
| -0.367999999999997 | 0.873 | 0.118 | 0.016 |
| -0.363999999999997 | 0.876 | 0.116 | 0.015 |
| -0.359999999999997 | 0.878 | 0.114 | 0.015 |
| -0.355999999999997 | 0.881 | 0.112 | 0.014 |
| -0.351999999999997 | 0.883 | 0.109 | 0.014 |
| -0.347999999999997 | 0.886 | 0.107 | 0.013 |
| -0.343999999999997 | 0.888 | 0.105 | 0.012 |
| -0.339999999999997 | 0.891 | 0.103 | 0.012 |
| -0.335999999999997 | 0.893 | 0.101 | 0.011 |
| -0.331999999999997 | 0.896 | 0.099 | 0.011 |
| -0.327999999999997 | 0.898 | 0.097 | 0.01 |
| -0.323999999999997 | 0.9 | 0.095 | 0.01 |
| -0.319999999999997 | 0.903 | 0.092 | 0.009 |
| -0.315999999999997 | 0.905 | 0.09 | 0.009 |
| -0.311999999999997 | 0.907 | 0.088 | 0.009 |
| -0.307999999999997 | 0.909 | 0.086 | 0.008 |
| -0.303999999999997 | 0.912 | 0.084 | 0.008 |
| -0.299999999999997 | 0.914 | 0.082 | 0.007 |
| -0.295999999999997 | 0.916 | 0.08 | 0.007 |
| -0.291999999999997 | 0.918 | 0.078 | 0.007 |
| -0.287999999999997 | 0.92 | 0.076 | 0.006 |
| -0.283999999999997 | 0.923 | 0.074 | 0.006 |
| -0.279999999999997 | 0.925 | 0.072 | 0.006 |
| -0.275999999999997 | 0.927 | 0.071 | 0.005 |
| -0.271999999999997 | 0.929 | 0.069 | 0.005 |
| -0.267999999999997 | 0.931 | 0.067 | 0.005 |
| -0.263999999999997 | 0.933 | 0.065 | 0.005 |
| -0.259999999999997 | 0.935 | 0.063 | 0.004 |
| -0.255999999999997 | 0.937 | 0.061 | 0.004 |
| -0.251999999999997 | 0.938 | 0.06 | 0.004 |
| -0.247999999999997 | 0.94 | 0.058 | 0.004 |
| -0.243999999999997 | 0.942 | 0.056 | 0.003 |
| -0.239999999999997 | 0.944 | 0.054 | 0.003 |
| -0.235999999999997 | 0.946 | 0.053 | 0.003 |
| -0.231999999999997 | 0.948 | 0.051 | 0.003 |
| -0.227999999999997 | 0.949 | 0.049 | 0.003 |
| -0.223999999999997 | 0.951 | 0.048 | 0.002 |
| -0.219999999999997 | 0.953 | 0.046 | 0.002 |
| -0.215999999999997 | 0.954 | 0.045 | 0.002 |
| -0.211999999999997 | 0.956 | 0.043 | 0.002 |
| -0.207999999999997 | 0.958 | 0.041 | 0.002 |
| -0.203999999999997 | 0.959 | 0.04 | 0.002 |
| -0.199999999999997 | 0.961 | 0.038 | 0.002 |
| -0.195999999999997 | 0.962 | 0.037 | 0.001 |
| -0.191999999999997 | 0.964 | 0.036 | 0.001 |
| -0.187999999999997 | 0.965 | 0.034 | 0.001 |
| -0.183999999999997 | 0.967 | 0.033 | 0.001 |
| -0.179999999999997 | 0.968 | 0.031 | 0.001 |
| -0.175999999999997 | 0.969 | 0.03 | 0.001 |
| -0.171999999999997 | 0.971 | 0.029 | 0.001 |
| -0.167999999999997 | 0.972 | 0.027 | 0.001 |
| -0.163999999999997 | 0.973 | 0.026 | 0.001 |
| -0.159999999999997 | 0.975 | 0.025 | 0.001 |
| -0.155999999999997 | 0.976 | 0.024 | 0.001 |
| -0.151999999999997 | 0.977 | 0.023 | 0.001 |
| -0.147999999999997 | 0.978 | 0.021 | 0 |
| -0.143999999999997 | 0.979 | 0.02 | 0 |
| -0.139999999999997 | 0.981 | 0.019 | 0 |
| -0.135999999999997 | 0.982 | 0.018 | 0 |
| -0.131999999999997 | 0.983 | 0.017 | 0 |
| -0.127999999999997 | 0.984 | 0.016 | 0 |
| -0.123999999999997 | 0.985 | 0.015 | 0 |
| -0.119999999999997 | 0.986 | 0.014 | 0 |
| -0.115999999999997 | 0.987 | 0.013 | 0 |
| -0.111999999999997 | 0.988 | 0.012 | 0 |
| -0.107999999999997 | 0.988 | 0.012 | 0 |
| -0.103999999999997 | 0.989 | 0.011 | 0 |
| -0.0999999999999965 | 0.99 | 0.01 | 0 |
| -0.0959999999999965 | 0.991 | 0.009 | 0 |
| -0.0919999999999965 | 0.992 | 0.008 | 0 |
| -0.0879999999999965 | 0.992 | 0.008 | 0 |
| -0.0839999999999965 | 0.993 | 0.007 | 0 |
| -0.0799999999999965 | 0.994 | 0.006 | 0 |
| -0.0759999999999965 | 0.994 | 0.006 | 0 |
| -0.0719999999999965 | 0.995 | 0.005 | 0 |
| -0.0679999999999965 | 0.995 | 0.005 | 0 |
| -0.0639999999999965 | 0.996 | 0.004 | 0 |
| -0.0599999999999965 | 0.996 | 0.004 | 0 |
| -0.0559999999999965 | 0.997 | 0.003 | 0 |
| -0.0519999999999965 | 0.997 | 0.003 | 0 |
| -0.0479999999999965 | 0.998 | 0.002 | 0 |
| -0.0439999999999965 | 0.998 | 0.002 | 0 |
| -0.0399999999999965 | 0.998 | 0.002 | 0 |
| -0.0359999999999965 | 0.999 | 0.001 | 0 |
| -0.0319999999999965 | 0.999 | 0.001 | 0 |
| -0.0279999999999965 | 0.999 | 0.001 | 0 |
| -0.0239999999999965 | 0.999 | 0.001 | 0 |
| -0.0199999999999965 | 1 | 0 | 0 |
| -0.0159999999999965 | 1 | 0 | 0 |
| -0.0119999999999965 | 1 | 0 | 0 |
| -0.00799999999999647 | 1 | 0 | 0 |
| -0.00399999999999647 | 1 | 0 | 0 |
| 3.52495810318487e-15 | 1 | 0 | 0 |
| 0.00400000000000352 | 1 | 0 | 0 |
| 0.00800000000000352 | 1 | 0 | 0 |
| 0.0120000000000035 | 1 | 0 | 0 |
| 0.0160000000000035 | 1 | 0 | 0 |
| 0.0200000000000035 | 1 | 0 | 0 |
| 0.0240000000000035 | 0.999 | 0.001 | 0 |
| 0.0280000000000035 | 0.999 | 0.001 | 0 |
| 0.0320000000000035 | 0.999 | 0.001 | 0 |
| 0.0360000000000035 | 0.999 | 0.001 | 0 |
| 0.0400000000000035 | 0.998 | 0.002 | 0 |
| 0.0440000000000035 | 0.998 | 0.002 | 0 |
| 0.0480000000000035 | 0.998 | 0.002 | 0 |
| 0.0520000000000035 | 0.997 | 0.003 | 0 |
| 0.0560000000000035 | 0.997 | 0.003 | 0 |
| 0.0600000000000035 | 0.996 | 0.004 | 0 |
| 0.0640000000000035 | 0.996 | 0.004 | 0 |
| 0.0680000000000035 | 0.995 | 0.005 | 0 |
| 0.0720000000000036 | 0.995 | 0.005 | 0 |
| 0.0760000000000036 | 0.994 | 0.006 | 0 |
| 0.0800000000000036 | 0.994 | 0.006 | 0 |
| 0.0840000000000036 | 0.993 | 0.007 | 0 |
| 0.0880000000000036 | 0.992 | 0.008 | 0 |
| 0.0920000000000036 | 0.992 | 0.008 | 0 |
| 0.0960000000000036 | 0.991 | 0.009 | 0 |
| 0.100000000000004 | 0.99 | 0.01 | 0 |
| 0.104000000000004 | 0.989 | 0.011 | 0 |
| 0.108000000000004 | 0.988 | 0.012 | 0 |
| 0.112000000000004 | 0.988 | 0.012 | 0 |
| 0.116000000000004 | 0.987 | 0.013 | 0 |
| 0.120000000000004 | 0.986 | 0.014 | 0 |
| 0.124000000000004 | 0.985 | 0.015 | 0 |
| 0.128000000000004 | 0.984 | 0.016 | 0 |
| 0.132000000000004 | 0.983 | 0.017 | 0 |
| 0.136000000000004 | 0.982 | 0.018 | 0 |
| 0.140000000000004 | 0.981 | 0.019 | 0 |
| 0.144000000000004 | 0.979 | 0.02 | 0 |
| 0.148000000000004 | 0.978 | 0.021 | 0 |
| 0.152000000000004 | 0.977 | 0.023 | 0.001 |
| 0.156000000000004 | 0.976 | 0.024 | 0.001 |
| 0.160000000000004 | 0.975 | 0.025 | 0.001 |
| 0.164000000000004 | 0.973 | 0.026 | 0.001 |
| 0.168000000000004 | 0.972 | 0.027 | 0.001 |
| 0.172000000000004 | 0.971 | 0.029 | 0.001 |
| 0.176000000000004 | 0.969 | 0.03 | 0.001 |
| 0.180000000000004 | 0.968 | 0.031 | 0.001 |
| 0.184000000000004 | 0.967 | 0.033 | 0.001 |
| 0.188000000000004 | 0.965 | 0.034 | 0.001 |
| 0.192000000000004 | 0.964 | 0.036 | 0.001 |
| 0.196000000000004 | 0.962 | 0.037 | 0.001 |
| 0.200000000000004 | 0.961 | 0.038 | 0.002 |
| 0.204000000000004 | 0.959 | 0.04 | 0.002 |
| 0.208000000000004 | 0.958 | 0.041 | 0.002 |
| 0.212000000000004 | 0.956 | 0.043 | 0.002 |
| 0.216000000000004 | 0.954 | 0.045 | 0.002 |
| 0.220000000000004 | 0.953 | 0.046 | 0.002 |
| 0.224000000000004 | 0.951 | 0.048 | 0.002 |
| 0.228000000000004 | 0.949 | 0.049 | 0.003 |
| 0.232000000000004 | 0.948 | 0.051 | 0.003 |
| 0.236000000000004 | 0.946 | 0.053 | 0.003 |
| 0.240000000000004 | 0.944 | 0.054 | 0.003 |
| 0.244000000000004 | 0.942 | 0.056 | 0.003 |
| 0.248000000000004 | 0.94 | 0.058 | 0.004 |
| 0.252000000000004 | 0.938 | 0.06 | 0.004 |
| 0.256000000000004 | 0.937 | 0.061 | 0.004 |
| 0.260000000000004 | 0.935 | 0.063 | 0.004 |
| 0.264000000000004 | 0.933 | 0.065 | 0.005 |
| 0.268000000000004 | 0.931 | 0.067 | 0.005 |
| 0.272000000000004 | 0.929 | 0.069 | 0.005 |
| 0.276000000000004 | 0.927 | 0.071 | 0.005 |
| 0.280000000000004 | 0.925 | 0.072 | 0.006 |
| 0.284000000000004 | 0.923 | 0.074 | 0.006 |
| 0.288000000000004 | 0.92 | 0.076 | 0.006 |
| 0.292000000000004 | 0.918 | 0.078 | 0.007 |
| 0.296000000000004 | 0.916 | 0.08 | 0.007 |
| 0.300000000000004 | 0.914 | 0.082 | 0.007 |
| 0.304000000000004 | 0.912 | 0.084 | 0.008 |
| 0.308000000000004 | 0.909 | 0.086 | 0.008 |
| 0.312000000000004 | 0.907 | 0.088 | 0.009 |
| 0.316000000000004 | 0.905 | 0.09 | 0.009 |
| 0.320000000000004 | 0.903 | 0.092 | 0.009 |
| 0.324000000000004 | 0.9 | 0.095 | 0.01 |
| 0.328000000000004 | 0.898 | 0.097 | 0.01 |
| 0.332000000000004 | 0.896 | 0.099 | 0.011 |
| 0.336000000000004 | 0.893 | 0.101 | 0.011 |
| 0.340000000000004 | 0.891 | 0.103 | 0.012 |
| 0.344000000000004 | 0.888 | 0.105 | 0.012 |
| 0.348000000000004 | 0.886 | 0.107 | 0.013 |
| 0.352000000000004 | 0.883 | 0.109 | 0.014 |
| 0.356000000000004 | 0.881 | 0.112 | 0.014 |
| 0.360000000000004 | 0.878 | 0.114 | 0.015 |
| 0.364000000000004 | 0.876 | 0.116 | 0.015 |
| 0.368000000000004 | 0.873 | 0.118 | 0.016 |
| 0.372000000000004 | 0.871 | 0.12 | 0.017 |
| 0.376000000000004 | 0.868 | 0.123 | 0.017 |
| 0.380000000000004 | 0.866 | 0.125 | 0.018 |
| 0.384000000000004 | 0.863 | 0.127 | 0.019 |
| 0.388000000000004 | 0.86 | 0.13 | 0.019 |
| 0.392000000000004 | 0.858 | 0.132 | 0.02 |
| 0.396000000000004 | 0.855 | 0.134 | 0.021 |
| 0.400000000000004 | 0.852 | 0.136 | 0.022 |
| 0.404000000000004 | 0.849 | 0.139 | 0.023 |
| 0.408000000000004 | 0.847 | 0.141 | 0.023 |
| 0.412000000000004 | 0.844 | 0.143 | 0.024 |
| 0.416000000000004 | 0.841 | 0.146 | 0.025 |
| 0.420000000000004 | 0.838 | 0.148 | 0.026 |
| 0.424000000000004 | 0.835 | 0.15 | 0.027 |
| 0.428000000000004 | 0.833 | 0.153 | 0.028 |
| 0.432000000000004 | 0.83 | 0.155 | 0.029 |
| 0.436000000000004 | 0.827 | 0.157 | 0.03 |
| 0.440000000000004 | 0.824 | 0.16 | 0.031 |
| 0.444000000000004 | 0.821 | 0.162 | 0.032 |
| 0.448000000000004 | 0.818 | 0.164 | 0.033 |
| 0.452000000000004 | 0.815 | 0.167 | 0.034 |
| 0.456000000000004 | 0.812 | 0.169 | 0.035 |
| 0.460000000000004 | 0.809 | 0.171 | 0.036 |
| 0.464000000000004 | 0.806 | 0.174 | 0.037 |
| 0.468000000000004 | 0.803 | 0.176 | 0.039 |
| 0.472000000000004 | 0.8 | 0.178 | 0.04 |
| 0.476000000000004 | 0.797 | 0.181 | 0.041 |
| 0.480000000000004 | 0.794 | 0.183 | 0.042 |
| 0.484000000000004 | 0.791 | 0.185 | 0.043 |
| 0.488000000000004 | 0.788 | 0.188 | 0.045 |
| 0.492000000000004 | 0.785 | 0.19 | 0.046 |
| 0.496000000000004 | 0.782 | 0.192 | 0.047 |
| 0.500000000000004 | 0.779 | 0.195 | 0.049 |
| 0.504000000000004 | 0.776 | 0.197 | 0.05 |
| 0.508000000000004 | 0.773 | 0.199 | 0.051 |
| 0.512000000000004 | 0.769 | 0.202 | 0.053 |
| 0.516000000000004 | 0.766 | 0.204 | 0.054 |
| 0.520000000000004 | 0.763 | 0.206 | 0.056 |
| 0.524000000000004 | 0.76 | 0.209 | 0.057 |
| 0.528000000000004 | 0.757 | 0.211 | 0.059 |
| 0.532000000000004 | 0.754 | 0.213 | 0.06 |
| 0.536000000000004 | 0.75 | 0.216 | 0.062 |
| 0.540000000000004 | 0.747 | 0.218 | 0.064 |
| 0.544000000000004 | 0.744 | 0.22 | 0.065 |
| 0.548000000000004 | 0.741 | 0.222 | 0.067 |
| 0.552000000000004 | 0.737 | 0.225 | 0.068 |
| 0.556000000000004 | 0.734 | 0.227 | 0.07 |
| 0.560000000000004 | 0.731 | 0.229 | 0.072 |
| 0.564000000000004 | 0.728 | 0.231 | 0.074 |
| 0.568000000000004 | 0.724 | 0.234 | 0.075 |
| 0.572000000000004 | 0.721 | 0.236 | 0.077 |
| 0.576000000000004 | 0.718 | 0.238 | 0.079 |
| 0.580000000000004 | 0.714 | 0.24 | 0.081 |
| 0.584000000000004 | 0.711 | 0.242 | 0.083 |
| 0.588000000000004 | 0.708 | 0.245 | 0.085 |
| 0.592000000000004 | 0.704 | 0.247 | 0.087 |
| 0.596000000000004 | 0.701 | 0.249 | 0.088 |
| 0.600000000000004 | 0.698 | 0.251 | 0.09 |
| 0.604000000000004 | 0.694 | 0.253 | 0.092 |
| 0.608000000000004 | 0.691 | 0.255 | 0.094 |
| 0.612000000000004 | 0.688 | 0.258 | 0.096 |
| 0.616000000000004 | 0.684 | 0.26 | 0.099 |
| 0.620000000000004 | 0.681 | 0.262 | 0.101 |
| 0.624000000000004 | 0.677 | 0.264 | 0.103 |
| 0.628000000000004 | 0.674 | 0.266 | 0.105 |
| 0.632000000000004 | 0.671 | 0.268 | 0.107 |
| 0.636000000000004 | 0.667 | 0.27 | 0.109 |
| 0.640000000000004 | 0.664 | 0.272 | 0.111 |
| 0.644000000000004 | 0.661 | 0.274 | 0.114 |
| 0.648000000000004 | 0.657 | 0.276 | 0.116 |
| 0.652000000000004 | 0.654 | 0.278 | 0.118 |
| 0.656000000000004 | 0.65 | 0.28 | 0.12 |
| 0.660000000000004 | 0.647 | 0.282 | 0.123 |
| 0.664000000000004 | 0.643 | 0.284 | 0.125 |
| 0.668000000000004 | 0.64 | 0.286 | 0.127 |
| 0.672000000000004 | 0.637 | 0.287 | 0.13 |
| 0.676000000000004 | 0.633 | 0.289 | 0.132 |
| 0.680000000000004 | 0.63 | 0.291 | 0.135 |
| 0.684000000000004 | 0.626 | 0.293 | 0.137 |
| 0.688000000000004 | 0.623 | 0.295 | 0.14 |
| 0.692000000000004 | 0.619 | 0.297 | 0.142 |
| 0.696000000000004 | 0.616 | 0.298 | 0.145 |
| 0.700000000000004 | 0.613 | 0.3 | 0.147 |
| 0.704000000000004 | 0.609 | 0.302 | 0.15 |
| 0.708000000000004 | 0.606 | 0.304 | 0.152 |
| 0.712000000000004 | 0.602 | 0.305 | 0.155 |
| 0.716000000000004 | 0.599 | 0.307 | 0.157 |
| 0.720000000000004 | 0.595 | 0.309 | 0.16 |
| 0.724000000000004 | 0.592 | 0.31 | 0.163 |
| 0.728000000000004 | 0.589 | 0.312 | 0.165 |
| 0.732000000000004 | 0.585 | 0.314 | 0.168 |
| 0.736000000000004 | 0.582 | 0.315 | 0.171 |
| 0.740000000000004 | 0.578 | 0.317 | 0.173 |
| 0.744000000000004 | 0.575 | 0.318 | 0.176 |
| 0.748000000000004 | 0.571 | 0.32 | 0.179 |
| 0.752000000000004 | 0.568 | 0.321 | 0.182 |
| 0.756000000000004 | 0.565 | 0.323 | 0.184 |
| 0.760000000000004 | 0.561 | 0.324 | 0.187 |
| 0.764000000000004 | 0.558 | 0.326 | 0.19 |
| 0.768000000000004 | 0.554 | 0.327 | 0.193 |
| 0.772000000000004 | 0.551 | 0.328 | 0.196 |
| 0.776000000000004 | 0.548 | 0.33 | 0.199 |
| 0.780000000000004 | 0.544 | 0.331 | 0.201 |
| 0.784000000000004 | 0.541 | 0.332 | 0.204 |
| 0.788000000000004 | 0.537 | 0.334 | 0.207 |
| 0.792000000000004 | 0.534 | 0.335 | 0.21 |
| 0.796000000000004 | 0.531 | 0.336 | 0.213 |
| 0.800000000000004 | 0.527 | 0.337 | 0.216 |
| 0.804000000000004 | 0.524 | 0.339 | 0.219 |
| 0.808000000000004 | 0.521 | 0.34 | 0.222 |
| 0.812000000000004 | 0.517 | 0.341 | 0.225 |
| 0.816000000000004 | 0.514 | 0.342 | 0.228 |
| 0.820000000000004 | 0.51 | 0.343 | 0.231 |
| 0.824000000000004 | 0.507 | 0.344 | 0.234 |
| 0.828000000000004 | 0.504 | 0.345 | 0.237 |
| 0.832000000000004 | 0.5 | 0.346 | 0.24 |
| 0.836000000000004 | 0.497 | 0.347 | 0.243 |
| 0.840000000000004 | 0.494 | 0.348 | 0.246 |
| 0.844000000000004 | 0.49 | 0.349 | 0.249 |
| 0.848000000000004 | 0.487 | 0.35 | 0.252 |
| 0.852000000000004 | 0.484 | 0.351 | 0.255 |
| 0.856000000000004 | 0.481 | 0.352 | 0.258 |
| 0.860000000000004 | 0.477 | 0.353 | 0.261 |
| 0.864000000000004 | 0.474 | 0.354 | 0.264 |
| 0.868000000000004 | 0.471 | 0.355 | 0.267 |
| 0.872000000000004 | 0.467 | 0.355 | 0.27 |
| 0.876000000000004 | 0.464 | 0.356 | 0.273 |
| 0.880000000000004 | 0.461 | 0.357 | 0.276 |
| 0.884000000000004 | 0.458 | 0.358 | 0.28 |
| 0.888000000000004 | 0.455 | 0.358 | 0.283 |
| 0.892000000000004 | 0.451 | 0.359 | 0.286 |
| 0.896000000000004 | 0.448 | 0.36 | 0.289 |
| 0.900000000000004 | 0.445 | 0.36 | 0.292 |
| 0.904000000000004 | 0.442 | 0.361 | 0.295 |
| 0.908000000000004 | 0.438 | 0.362 | 0.298 |
| 0.912000000000004 | 0.435 | 0.362 | 0.301 |
| 0.916000000000004 | 0.432 | 0.363 | 0.304 |
| 0.920000000000004 | 0.429 | 0.363 | 0.307 |
| 0.924000000000004 | 0.426 | 0.364 | 0.31 |
| 0.928000000000004 | 0.423 | 0.364 | 0.313 |
| 0.932000000000004 | 0.42 | 0.364 | 0.317 |
| 0.936000000000004 | 0.416 | 0.365 | 0.32 |
| 0.940000000000004 | 0.413 | 0.365 | 0.323 |
| 0.944000000000004 | 0.41 | 0.366 | 0.326 |
| 0.948000000000004 | 0.407 | 0.366 | 0.329 |
| 0.952000000000004 | 0.404 | 0.366 | 0.332 |
| 0.956000000000004 | 0.401 | 0.366 | 0.335 |
| 0.960000000000004 | 0.398 | 0.367 | 0.338 |
| 0.964000000000004 | 0.395 | 0.367 | 0.341 |
| 0.968000000000004 | 0.392 | 0.367 | 0.344 |
| 0.972000000000004 | 0.389 | 0.367 | 0.347 |
| 0.976000000000004 | 0.386 | 0.367 | 0.35 |
| 0.980000000000004 | 0.383 | 0.368 | 0.353 |
| 0.984000000000004 | 0.38 | 0.368 | 0.356 |
| 0.988000000000004 | 0.377 | 0.368 | 0.359 |
| 0.992000000000004 | 0.374 | 0.368 | 0.362 |
| 0.996000000000004 | 0.371 | 0.368 | 0.365 |
| 1.000000000000004 | 0.368 | 0.368 | 0.368 |
| 1.004000000000004 | 0.365 | 0.368 | 0.371 |
| 1.008000000000004 | 0.362 | 0.368 | 0.374 |
| 1.012000000000004 | 0.359 | 0.368 | 0.377 |
| 1.016000000000004 | 0.356 | 0.368 | 0.38 |
| 1.020000000000004 | 0.353 | 0.368 | 0.382 |
| 1.024000000000004 | 0.35 | 0.367 | 0.385 |
| 1.028000000000004 | 0.348 | 0.367 | 0.388 |
| 1.032000000000004 | 0.345 | 0.367 | 0.391 |
| 1.036000000000004 | 0.342 | 0.367 | 0.394 |
| 1.040000000000004 | 0.339 | 0.367 | 0.397 |
| 1.044000000000004 | 0.336 | 0.366 | 0.399 |
| 1.048000000000004 | 0.333 | 0.366 | 0.402 |
| 1.052000000000004 | 0.331 | 0.366 | 0.405 |
| 1.056000000000004 | 0.328 | 0.366 | 0.408 |
| 1.060000000000004 | 0.325 | 0.365 | 0.41 |
| 1.064000000000004 | 0.322 | 0.365 | 0.413 |
| 1.068000000000004 | 0.32 | 0.365 | 0.416 |
| 1.072000000000004 | 0.317 | 0.364 | 0.418 |
| 1.076000000000004 | 0.314 | 0.364 | 0.421 |
| 1.080000000000004 | 0.311 | 0.363 | 0.424 |
| 1.084000000000004 | 0.309 | 0.363 | 0.426 |
| 1.088000000000004 | 0.306 | 0.362 | 0.429 |
| 1.092000000000004 | 0.303 | 0.362 | 0.432 |
| 1.096000000000004 | 0.301 | 0.361 | 0.434 |
| 1.100000000000004 | 0.298 | 0.361 | 0.437 |
| 1.104000000000004 | 0.296 | 0.36 | 0.439 |
| 1.108000000000004 | 0.293 | 0.36 | 0.442 |
| 1.112000000000004 | 0.29 | 0.359 | 0.444 |
| 1.116000000000004 | 0.288 | 0.358 | 0.446 |
| 1.120000000000004 | 0.285 | 0.358 | 0.449 |
| 1.124000000000004 | 0.283 | 0.357 | 0.451 |
| 1.128000000000004 | 0.28 | 0.356 | 0.454 |
| 1.132000000000004 | 0.278 | 0.356 | 0.456 |
| 1.136000000000004 | 0.275 | 0.355 | 0.458 |
| 1.140000000000004 | 0.273 | 0.354 | 0.46 |
| 1.144000000000004 | 0.27 | 0.354 | 0.463 |
| 1.148000000000004 | 0.268 | 0.353 | 0.465 |
| 1.152000000000004 | 0.265 | 0.352 | 0.467 |
| 1.156000000000004 | 0.263 | 0.351 | 0.469 |
| 1.160000000000004 | 0.26 | 0.35 | 0.471 |
| 1.164000000000004 | 0.258 | 0.35 | 0.474 |
| 1.168000000000004 | 0.256 | 0.349 | 0.476 |
| 1.172000000000004 | 0.253 | 0.348 | 0.478 |
| 1.176000000000004 | 0.251 | 0.347 | 0.48 |
| 1.180000000000004 | 0.248 | 0.346 | 0.482 |
| 1.184000000000004 | 0.246 | 0.345 | 0.484 |
| 1.188000000000004 | 0.244 | 0.344 | 0.486 |
| 1.192000000000004 | 0.242 | 0.343 | 0.488 |
| 1.196000000000004 | 0.239 | 0.342 | 0.489 |
| 1.200000000000004 | 0.237 | 0.341 | 0.491 |
| 1.204000000000004 | 0.235 | 0.34 | 0.493 |
| 1.208000000000004 | 0.232 | 0.339 | 0.495 |
| 1.212000000000004 | 0.23 | 0.338 | 0.497 |
| 1.216000000000004 | 0.228 | 0.337 | 0.498 |
| 1.220000000000004 | 0.226 | 0.336 | 0.5 |
| 1.224000000000004 | 0.224 | 0.335 | 0.502 |
| 1.228000000000004 | 0.221 | 0.334 | 0.503 |
| 1.232000000000004 | 0.219 | 0.333 | 0.505 |
| 1.236000000000004 | 0.217 | 0.332 | 0.507 |
| 1.240000000000004 | 0.215 | 0.33 | 0.508 |
| 1.244000000000004 | 0.213 | 0.329 | 0.51 |
| 1.248000000000004 | 0.211 | 0.328 | 0.511 |
| 1.252000000000004 | 0.209 | 0.327 | 0.512 |
| 1.256000000000004 | 0.206 | 0.326 | 0.514 |
| 1.260000000000004 | 0.204 | 0.325 | 0.515 |
| 1.264000000000004 | 0.202 | 0.323 | 0.517 |
| 1.268000000000004 | 0.2 | 0.322 | 0.518 |
| 1.272000000000004 | 0.198 | 0.321 | 0.519 |
| 1.276000000000004 | 0.196 | 0.32 | 0.52 |
| 1.280000000000004 | 0.194 | 0.318 | 0.522 |
| 1.284000000000004 | 0.192 | 0.317 | 0.523 |
| 1.288000000000004 | 0.19 | 0.316 | 0.524 |
| 1.292000000000004 | 0.188 | 0.314 | 0.525 |
| 1.296000000000004 | 0.186 | 0.313 | 0.526 |
| 1.300000000000004 | 0.185 | 0.312 | 0.527 |
| 1.304000000000004 | 0.183 | 0.311 | 0.528 |
| 1.308000000000004 | 0.181 | 0.309 | 0.529 |
| 1.312000000000004 | 0.179 | 0.308 | 0.53 |
| 1.316000000000004 | 0.177 | 0.306 | 0.531 |
| 1.320000000000004 | 0.175 | 0.305 | 0.532 |
| 1.324000000000004 | 0.173 | 0.304 | 0.532 |
| 1.328000000000004 | 0.171 | 0.302 | 0.533 |
| 1.332000000000004 | 0.17 | 0.301 | 0.534 |
| 1.336000000000004 | 0.168 | 0.3 | 0.535 |
| 1.340000000000004 | 0.166 | 0.298 | 0.535 |
| 1.344000000000004 | 0.164 | 0.297 | 0.536 |
| 1.348000000000004 | 0.162 | 0.295 | 0.537 |
| 1.352000000000004 | 0.161 | 0.294 | 0.537 |
| 1.356000000000004 | 0.159 | 0.292 | 0.538 |
| 1.360000000000004 | 0.157 | 0.291 | 0.538 |
| 1.364000000000004 | 0.156 | 0.289 | 0.539 |
| 1.368000000000004 | 0.154 | 0.288 | 0.539 |
| 1.372000000000004 | 0.152 | 0.287 | 0.539 |
| 1.376000000000004 | 0.151 | 0.285 | 0.54 |
| 1.380000000000004 | 0.149 | 0.284 | 0.54 |
| 1.384000000000004 | 0.147 | 0.282 | 0.54 |
| 1.388000000000005 | 0.146 | 0.281 | 0.541 |
| 1.392000000000004 | 0.144 | 0.279 | 0.541 |
| 1.396000000000004 | 0.142 | 0.278 | 0.541 |
| 1.400000000000005 | 0.141 | 0.276 | 0.541 |
| 1.404000000000005 | 0.139 | 0.275 | 0.541 |
| 1.408000000000005 | 0.138 | 0.273 | 0.541 |
| 1.412000000000005 | 0.136 | 0.272 | 0.541 |
| 1.416000000000005 | 0.135 | 0.27 | 0.541 |
| 1.420000000000005 | 0.133 | 0.268 | 0.541 |
| 1.424000000000005 | 0.132 | 0.267 | 0.541 |
| 1.428000000000005 | 0.13 | 0.265 | 0.541 |
| 1.432000000000005 | 0.129 | 0.264 | 0.541 |
| 1.436000000000005 | 0.127 | 0.262 | 0.541 |
| 1.440000000000005 | 0.126 | 0.261 | 0.541 |
| 1.444000000000005 | 0.124 | 0.259 | 0.54 |
| 1.448000000000005 | 0.123 | 0.258 | 0.54 |
| 1.452000000000005 | 0.121 | 0.256 | 0.54 |
| 1.456000000000005 | 0.12 | 0.254 | 0.539 |
| 1.460000000000005 | 0.119 | 0.253 | 0.539 |
| 1.464000000000005 | 0.117 | 0.251 | 0.539 |
| 1.468000000000005 | 0.116 | 0.25 | 0.538 |
| 1.472000000000005 | 0.115 | 0.248 | 0.538 |
| 1.476000000000005 | 0.113 | 0.247 | 0.537 |
| 1.480000000000005 | 0.112 | 0.245 | 0.537 |
| 1.484000000000005 | 0.111 | 0.243 | 0.536 |
| 1.488000000000005 | 0.109 | 0.242 | 0.536 |
| 1.492000000000005 | 0.108 | 0.24 | 0.535 |
| 1.496000000000005 | 0.107 | 0.239 | 0.534 |
| 1.500000000000005 | 0.105 | 0.237 | 0.534 |
| 1.504000000000005 | 0.104 | 0.236 | 0.533 |
| 1.508000000000005 | 0.103 | 0.234 | 0.532 |
| 1.512000000000005 | 0.102 | 0.232 | 0.531 |
| 1.516000000000005 | 0.1 | 0.231 | 0.53 |
| 1.520000000000005 | 0.099 | 0.229 | 0.53 |
| 1.524000000000005 | 0.098 | 0.228 | 0.529 |
| 1.528000000000005 | 0.097 | 0.226 | 0.528 |
| 1.532000000000005 | 0.096 | 0.225 | 0.527 |
| 1.536000000000005 | 0.094 | 0.223 | 0.526 |
| 1.540000000000005 | 0.093 | 0.221 | 0.525 |
| 1.544000000000005 | 0.092 | 0.22 | 0.524 |
| 1.548000000000005 | 0.091 | 0.218 | 0.523 |
| 1.552000000000005 | 0.09 | 0.217 | 0.522 |
| 1.556000000000005 | 0.089 | 0.215 | 0.521 |
| 1.560000000000005 | 0.088 | 0.213 | 0.52 |
| 1.564000000000005 | 0.087 | 0.212 | 0.518 |
| 1.568000000000005 | 0.086 | 0.21 | 0.517 |
| 1.572000000000005 | 0.084 | 0.209 | 0.516 |
| 1.576000000000005 | 0.083 | 0.207 | 0.515 |
| 1.580000000000005 | 0.082 | 0.206 | 0.513 |
| 1.584000000000005 | 0.081 | 0.204 | 0.512 |
| 1.588000000000005 | 0.08 | 0.203 | 0.511 |
| 1.592000000000005 | 0.079 | 0.201 | 0.509 |
| 1.596000000000005 | 0.078 | 0.199 | 0.508 |
| 1.600000000000005 | 0.077 | 0.198 | 0.507 |
| 1.604000000000005 | 0.076 | 0.196 | 0.505 |
| 1.608000000000005 | 0.075 | 0.195 | 0.504 |
| 1.612000000000005 | 0.074 | 0.193 | 0.502 |
| 1.616000000000005 | 0.073 | 0.192 | 0.501 |
| 1.620000000000005 | 0.072 | 0.19 | 0.499 |
| 1.624000000000005 | 0.072 | 0.189 | 0.498 |
| 1.628000000000005 | 0.071 | 0.187 | 0.496 |
| 1.632000000000005 | 0.07 | 0.186 | 0.495 |
| 1.636000000000005 | 0.069 | 0.184 | 0.493 |
| 1.640000000000005 | 0.068 | 0.183 | 0.491 |
| 1.644000000000005 | 0.067 | 0.181 | 0.49 |
| 1.648000000000005 | 0.066 | 0.18 | 0.488 |
| 1.652000000000005 | 0.065 | 0.178 | 0.486 |
| 1.656000000000005 | 0.064 | 0.177 | 0.484 |
| 1.660000000000005 | 0.064 | 0.175 | 0.483 |
| 1.664000000000005 | 0.063 | 0.174 | 0.481 |
| 1.668000000000005 | 0.062 | 0.172 | 0.479 |
| 1.672000000000005 | 0.061 | 0.171 | 0.477 |
| 1.676000000000005 | 0.06 | 0.169 | 0.476 |
| 1.680000000000005 | 0.059 | 0.168 | 0.474 |
| 1.684000000000005 | 0.059 | 0.166 | 0.472 |
| 1.688000000000005 | 0.058 | 0.165 | 0.47 |
| 1.692000000000005 | 0.057 | 0.163 | 0.468 |
| 1.696000000000005 | 0.056 | 0.162 | 0.466 |
| 1.700000000000005 | 0.056 | 0.161 | 0.464 |
| 1.704000000000005 | 0.055 | 0.159 | 0.462 |
| 1.708000000000005 | 0.054 | 0.158 | 0.46 |
| 1.712000000000005 | 0.053 | 0.156 | 0.458 |
| 1.716000000000005 | 0.053 | 0.155 | 0.456 |
| 1.720000000000005 | 0.052 | 0.154 | 0.454 |
| 1.724000000000005 | 0.051 | 0.152 | 0.452 |
| 1.728000000000005 | 0.05 | 0.151 | 0.45 |
| 1.732000000000005 | 0.05 | 0.149 | 0.448 |
| 1.736000000000005 | 0.049 | 0.148 | 0.446 |
| 1.740000000000005 | 0.048 | 0.147 | 0.444 |
| 1.744000000000005 | 0.048 | 0.145 | 0.442 |
| 1.748000000000005 | 0.047 | 0.144 | 0.44 |
| 1.752000000000005 | 0.046 | 0.143 | 0.438 |
| 1.756000000000005 | 0.046 | 0.141 | 0.435 |
| 1.760000000000005 | 0.045 | 0.14 | 0.433 |
| 1.764000000000005 | 0.045 | 0.139 | 0.431 |
| 1.768000000000005 | 0.044 | 0.137 | 0.429 |
| 1.772000000000005 | 0.043 | 0.136 | 0.427 |
| 1.776000000000005 | 0.043 | 0.135 | 0.425 |
| 1.780000000000005 | 0.042 | 0.133 | 0.422 |
| 1.784000000000005 | 0.041 | 0.132 | 0.42 |
| 1.788000000000005 | 0.041 | 0.131 | 0.418 |
| 1.792000000000005 | 0.04 | 0.129 | 0.416 |
| 1.796000000000005 | 0.04 | 0.128 | 0.413 |
| 1.800000000000005 | 0.039 | 0.127 | 0.411 |
| 1.804000000000005 | 0.039 | 0.126 | 0.409 |
| 1.808000000000005 | 0.038 | 0.124 | 0.407 |
| 1.812000000000005 | 0.038 | 0.123 | 0.404 |
| 1.816000000000005 | 0.037 | 0.122 | 0.402 |
| 1.820000000000005 | 0.036 | 0.121 | 0.4 |
| 1.824000000000005 | 0.036 | 0.119 | 0.397 |
| 1.828000000000005 | 0.035 | 0.118 | 0.395 |
| 1.832000000000005 | 0.035 | 0.117 | 0.393 |
| 1.836000000000005 | 0.034 | 0.116 | 0.39 |
| 1.840000000000005 | 0.034 | 0.115 | 0.388 |
| 1.844000000000005 | 0.033 | 0.113 | 0.386 |
| 1.848000000000005 | 0.033 | 0.112 | 0.383 |
| 1.852000000000005 | 0.032 | 0.111 | 0.381 |
| 1.856000000000005 | 0.032 | 0.11 | 0.379 |
| 1.860000000000005 | 0.031 | 0.109 | 0.376 |
| 1.864000000000005 | 0.031 | 0.108 | 0.374 |
| 1.868000000000005 | 0.031 | 0.106 | 0.372 |
| 1.872000000000005 | 0.03 | 0.105 | 0.369 |
| 1.876000000000005 | 0.03 | 0.104 | 0.367 |
| 1.880000000000005 | 0.029 | 0.103 | 0.364 |
| 1.884000000000005 | 0.029 | 0.102 | 0.362 |
| 1.888000000000005 | 0.028 | 0.101 | 0.36 |
| 1.892000000000005 | 0.028 | 0.1 | 0.357 |
| 1.896000000000005 | 0.027 | 0.099 | 0.355 |
| 1.900000000000005 | 0.027 | 0.098 | 0.353 |
| 1.904000000000005 | 0.027 | 0.097 | 0.35 |
| 1.908000000000005 | 0.026 | 0.096 | 0.348 |
| 1.912000000000005 | 0.026 | 0.094 | 0.345 |
| 1.916000000000005 | 0.025 | 0.093 | 0.343 |
| 1.920000000000005 | 0.025 | 0.092 | 0.341 |
| 1.924000000000005 | 0.025 | 0.091 | 0.338 |
| 1.928000000000005 | 0.024 | 0.09 | 0.336 |
| 1.932000000000005 | 0.024 | 0.089 | 0.333 |
| 1.936000000000005 | 0.024 | 0.088 | 0.331 |
| 1.940000000000005 | 0.023 | 0.087 | 0.329 |
| 1.944000000000005 | 0.023 | 0.086 | 0.326 |
| 1.948000000000005 | 0.022 | 0.085 | 0.324 |
| 1.952000000000005 | 0.022 | 0.084 | 0.321 |
| 1.956000000000005 | 0.022 | 0.083 | 0.319 |
| 1.960000000000005 | 0.021 | 0.082 | 0.317 |
| 1.964000000000005 | 0.021 | 0.081 | 0.314 |
| 1.968000000000005 | 0.021 | 0.081 | 0.312 |
| 1.972000000000005 | 0.02 | 0.08 | 0.31 |
| 1.976000000000005 | 0.02 | 0.079 | 0.307 |
| 1.980000000000005 | 0.02 | 0.078 | 0.305 |
| 1.984000000000005 | 0.02 | 0.077 | 0.302 |
| 1.988000000000005 | 0.019 | 0.076 | 0.3 |
| 1.992000000000005 | 0.019 | 0.075 | 0.298 |
| 1.996000000000005 | 0.019 | 0.074 | 0.295 |
| 2.000000000000005 | 0.018 | 0.073 | 0.293 |
| 2.004000000000005 | 0.018 | 0.072 | 0.291 |
| 2.008000000000005 | 0.018 | 0.072 | 0.288 |
| 2.012000000000005 | 0.017 | 0.071 | 0.286 |
| 2.016000000000005 | 0.017 | 0.07 | 0.284 |
| 2.020000000000005 | 0.017 | 0.069 | 0.281 |
| 2.024000000000005 | 0.017 | 0.068 | 0.279 |
| 2.028000000000005 | 0.016 | 0.067 | 0.277 |
| 2.032000000000005 | 0.016 | 0.066 | 0.274 |
| 2.036000000000005 | 0.016 | 0.066 | 0.272 |
| 2.040000000000005 | 0.016 | 0.065 | 0.27 |
| 2.044000000000005 | 0.015 | 0.064 | 0.268 |
| 2.048000000000005 | 0.015 | 0.063 | 0.265 |
| 2.052000000000005 | 0.015 | 0.062 | 0.263 |
| 2.056000000000005 | 0.015 | 0.062 | 0.261 |
| 2.060000000000005 | 0.014 | 0.061 | 0.259 |
| 2.064000000000005 | 0.014 | 0.06 | 0.256 |
| 2.068000000000005 | 0.014 | 0.059 | 0.254 |
| 2.072000000000005 | 0.014 | 0.059 | 0.252 |
| 2.076000000000005 | 0.013 | 0.058 | 0.25 |
| 2.080000000000005 | 0.013 | 0.057 | 0.247 |
| 2.084000000000005 | 0.013 | 0.056 | 0.245 |
| 2.088000000000005 | 0.013 | 0.056 | 0.243 |
| 2.092000000000005 | 0.013 | 0.055 | 0.241 |
| 2.096000000000005 | 0.012 | 0.054 | 0.239 |
| 2.100000000000005 | 0.012 | 0.054 | 0.236 |
| 2.104000000000005 | 0.012 | 0.053 | 0.234 |
| 2.108000000000005 | 0.012 | 0.052 | 0.232 |
| 2.112000000000005 | 0.012 | 0.052 | 0.23 |
| 2.116000000000005 | 0.011 | 0.051 | 0.228 |
| 2.120000000000005 | 0.011 | 0.05 | 0.226 |
| 2.124000000000005 | 0.011 | 0.05 | 0.224 |
| 2.128000000000005 | 0.011 | 0.049 | 0.221 |
| 2.132000000000005 | 0.011 | 0.048 | 0.219 |
| 2.136000000000005 | 0.01 | 0.048 | 0.217 |
| 2.140000000000005 | 0.01 | 0.047 | 0.215 |
| 2.144000000000005 | 0.01 | 0.046 | 0.213 |
| 2.148000000000005 | 0.01 | 0.046 | 0.211 |
| 2.152000000000005 | 0.01 | 0.045 | 0.209 |
| 2.156000000000005 | 0.01 | 0.045 | 0.207 |
| 2.160000000000005 | 0.009 | 0.044 | 0.205 |
| 2.164000000000005 | 0.009 | 0.043 | 0.203 |
| 2.168000000000005 | 0.009 | 0.043 | 0.201 |
| 2.172000000000005 | 0.009 | 0.042 | 0.199 |
| 2.176000000000005 | 0.009 | 0.042 | 0.197 |
| 2.180000000000005 | 0.009 | 0.041 | 0.195 |
| 2.184000000000005 | 0.008 | 0.04 | 0.193 |
| 2.188000000000005 | 0.008 | 0.04 | 0.191 |
| 2.192000000000005 | 0.008 | 0.039 | 0.189 |
| 2.196000000000005 | 0.008 | 0.039 | 0.187 |
| 2.200000000000005 | 0.008 | 0.038 | 0.185 |
| 2.204000000000005 | 0.008 | 0.038 | 0.183 |
| 2.208000000000005 | 0.008 | 0.037 | 0.181 |
| 2.212000000000005 | 0.007 | 0.037 | 0.18 |
| 2.216000000000005 | 0.007 | 0.036 | 0.178 |
| 2.220000000000005 | 0.007 | 0.036 | 0.176 |
| 2.224000000000005 | 0.007 | 0.035 | 0.174 |
| 2.228000000000005 | 0.007 | 0.035 | 0.172 |
| 2.232000000000005 | 0.007 | 0.034 | 0.17 |
| 2.236000000000005 | 0.007 | 0.034 | 0.168 |
| 2.240000000000005 | 0.007 | 0.033 | 0.167 |
| 2.244000000000005 | 0.007 | 0.033 | 0.165 |
| 2.248000000000005 | 0.006 | 0.032 | 0.163 |
| 2.252000000000005 | 0.006 | 0.032 | 0.161 |
| 2.256000000000005 | 0.006 | 0.031 | 0.16 |
| 2.260000000000005 | 0.006 | 0.031 | 0.158 |
| 2.264000000000005 | 0.006 | 0.03 | 0.156 |
| 2.268000000000005 | 0.006 | 0.03 | 0.154 |
| 2.272000000000005 | 0.006 | 0.03 | 0.153 |
| 2.276000000000005 | 0.006 | 0.029 | 0.151 |
| 2.280000000000005 | 0.006 | 0.029 | 0.149 |
| 2.284000000000005 | 0.005 | 0.028 | 0.148 |
| 2.288000000000005 | 0.005 | 0.028 | 0.146 |
| 2.292000000000005 | 0.005 | 0.027 | 0.144 |
| 2.296000000000005 | 0.005 | 0.027 | 0.143 |
| 2.300000000000005 | 0.005 | 0.027 | 0.141 |
| 2.304000000000005 | 0.005 | 0.026 | 0.139 |
| 2.308000000000005 | 0.005 | 0.026 | 0.138 |
| 2.312000000000005 | 0.005 | 0.025 | 0.136 |
| 2.316000000000005 | 0.005 | 0.025 | 0.135 |
| 2.320000000000005 | 0.005 | 0.025 | 0.133 |
| 2.324000000000005 | 0.005 | 0.024 | 0.132 |
| 2.328000000000005 | 0.004 | 0.024 | 0.13 |
| 2.332000000000005 | 0.004 | 0.024 | 0.129 |
| 2.336000000000005 | 0.004 | 0.023 | 0.127 |
| 2.340000000000005 | 0.004 | 0.023 | 0.126 |
| 2.344000000000005 | 0.004 | 0.023 | 0.124 |
| 2.348000000000005 | 0.004 | 0.022 | 0.123 |
| 2.352000000000005 | 0.004 | 0.022 | 0.121 |
| 2.356000000000005 | 0.004 | 0.022 | 0.12 |
| 2.360000000000005 | 0.004 | 0.021 | 0.118 |
| 2.364000000000005 | 0.004 | 0.021 | 0.117 |
| 2.368000000000005 | 0.004 | 0.021 | 0.115 |
| 2.372000000000005 | 0.004 | 0.02 | 0.114 |
| 2.376000000000005 | 0.004 | 0.02 | 0.113 |
| 2.380000000000005 | 0.003 | 0.02 | 0.111 |
| 2.384000000000005 | 0.003 | 0.019 | 0.11 |
| 2.388000000000005 | 0.003 | 0.019 | 0.109 |
| 2.392000000000005 | 0.003 | 0.019 | 0.107 |
| 2.396000000000005 | 0.003 | 0.018 | 0.106 |
| 2.400000000000005 | 0.003 | 0.018 | 0.105 |
| 2.404000000000005 | 0.003 | 0.018 | 0.103 |
| 2.408000000000005 | 0.003 | 0.018 | 0.102 |
| 2.412000000000005 | 0.003 | 0.017 | 0.101 |
| 2.416000000000005 | 0.003 | 0.017 | 0.099 |
| 2.420000000000005 | 0.003 | 0.017 | 0.098 |
| 2.424000000000005 | 0.003 | 0.016 | 0.097 |
| 2.428000000000005 | 0.003 | 0.016 | 0.096 |
| 2.432000000000005 | 0.003 | 0.016 | 0.094 |
| 2.436000000000005 | 0.003 | 0.016 | 0.093 |
| 2.440000000000005 | 0.003 | 0.015 | 0.092 |
| 2.444000000000005 | 0.003 | 0.015 | 0.091 |
| 2.448000000000005 | 0.002 | 0.015 | 0.09 |
| 2.452000000000005 | 0.002 | 0.015 | 0.089 |
| 2.456000000000005 | 0.002 | 0.014 | 0.087 |
| 2.460000000000005 | 0.002 | 0.014 | 0.086 |
| 2.464000000000005 | 0.002 | 0.014 | 0.085 |
| 2.468000000000005 | 0.002 | 0.014 | 0.084 |
| 2.472000000000005 | 0.002 | 0.014 | 0.083 |
| 2.476000000000005 | 0.002 | 0.013 | 0.082 |
| 2.480000000000005 | 0.002 | 0.013 | 0.081 |
| 2.484000000000005 | 0.002 | 0.013 | 0.08 |
| 2.488000000000005 | 0.002 | 0.013 | 0.079 |
| 2.492000000000005 | 0.002 | 0.012 | 0.077 |
| 2.496000000000005 | 0.002 | 0.012 | 0.076 |
| 2.500000000000005 | 0.002 | 0.012 | 0.075 |
| 2.504000000000005 | 0.002 | 0.012 | 0.074 |
| 2.508000000000005 | 0.002 | 0.012 | 0.073 |
| 2.512000000000005 | 0.002 | 0.011 | 0.072 |
| 2.516000000000005 | 0.002 | 0.011 | 0.071 |
| 2.520000000000005 | 0.002 | 0.011 | 0.07 |
| 2.524000000000005 | 0.002 | 0.011 | 0.069 |
| 2.528000000000005 | 0.002 | 0.011 | 0.068 |
| 2.532000000000005 | 0.002 | 0.011 | 0.068 |
| 2.536000000000005 | 0.002 | 0.01 | 0.067 |
| 2.540000000000005 | 0.002 | 0.01 | 0.066 |
| 2.544000000000005 | 0.002 | 0.01 | 0.065 |
| 2.548000000000005 | 0.002 | 0.01 | 0.064 |
| 2.552000000000005 | 0.001 | 0.01 | 0.063 |
| 2.556000000000005 | 0.001 | 0.01 | 0.062 |
| 2.560000000000005 | 0.001 | 0.009 | 0.061 |
| 2.564000000000005 | 0.001 | 0.009 | 0.06 |
| 2.568000000000005 | 0.001 | 0.009 | 0.059 |
| 2.572000000000005 | 0.001 | 0.009 | 0.059 |
| 2.576000000000005 | 0.001 | 0.009 | 0.058 |
| 2.580000000000005 | 0.001 | 0.009 | 0.057 |
| 2.584000000000005 | 0.001 | 0.008 | 0.056 |
| 2.588000000000005 | 0.001 | 0.008 | 0.055 |
| 2.592000000000005 | 0.001 | 0.008 | 0.055 |
| 2.596000000000005 | 0.001 | 0.008 | 0.054 |
| 2.600000000000005 | 0.001 | 0.008 | 0.053 |
| 2.604000000000005 | 0.001 | 0.008 | 0.052 |
| 2.608000000000005 | 0.001 | 0.008 | 0.051 |
| 2.612000000000005 | 0.001 | 0.007 | 0.051 |
| 2.616000000000005 | 0.001 | 0.007 | 0.05 |
| 2.620000000000005 | 0.001 | 0.007 | 0.049 |
| 2.624000000000005 | 0.001 | 0.007 | 0.048 |
| 2.628000000000005 | 0.001 | 0.007 | 0.048 |
| 2.632000000000005 | 0.001 | 0.007 | 0.047 |
| 2.636000000000005 | 0.001 | 0.007 | 0.046 |
| 2.640000000000005 | 0.001 | 0.007 | 0.046 |
| 2.644000000000005 | 0.001 | 0.006 | 0.045 |
| 2.648000000000005 | 0.001 | 0.006 | 0.044 |
| 2.652000000000005 | 0.001 | 0.006 | 0.044 |
| 2.656000000000005 | 0.001 | 0.006 | 0.043 |
| 2.660000000000005 | 0.001 | 0.006 | 0.042 |
| 2.664000000000005 | 0.001 | 0.006 | 0.042 |
| 2.668000000000005 | 0.001 | 0.006 | 0.041 |
| 2.672000000000005 | 0.001 | 0.006 | 0.04 |
| 2.676000000000005 | 0.001 | 0.006 | 0.04 |
| 2.680000000000005 | 0.001 | 0.005 | 0.039 |
| 2.684000000000005 | 0.001 | 0.005 | 0.039 |
| 2.688000000000005 | 0.001 | 0.005 | 0.038 |
| 2.692000000000005 | 0.001 | 0.005 | 0.037 |
| 2.696000000000005 | 0.001 | 0.005 | 0.037 |
| 2.700000000000005 | 0.001 | 0.005 | 0.036 |
| 2.704000000000005 | 0.001 | 0.005 | 0.036 |
| 2.708000000000005 | 0.001 | 0.005 | 0.035 |
| 2.712000000000005 | 0.001 | 0.005 | 0.035 |
| 2.716000000000005 | 0.001 | 0.005 | 0.034 |
| 2.720000000000005 | 0.001 | 0.005 | 0.034 |
| 2.724000000000005 | 0.001 | 0.004 | 0.033 |
| 2.728000000000005 | 0.001 | 0.004 | 0.032 |
| 2.732000000000005 | 0.001 | 0.004 | 0.032 |
| 2.736000000000005 | 0.001 | 0.004 | 0.031 |
| 2.740000000000005 | 0.001 | 0.004 | 0.031 |
| 2.744000000000005 | 0.001 | 0.004 | 0.03 |
| 2.748000000000005 | 0.001 | 0.004 | 0.03 |
| 2.752000000000005 | 0.001 | 0.004 | 0.029 |
| 2.756000000000005 | 0.001 | 0.004 | 0.029 |
| 2.760000000000005 | 0 | 0.004 | 0.029 |
| 2.764000000000005 | 0 | 0.004 | 0.028 |
| 2.768000000000005 | 0 | 0.004 | 0.028 |
| 2.772000000000005 | 0 | 0.004 | 0.027 |
| 2.776000000000005 | 0 | 0.003 | 0.027 |
| 2.780000000000005 | 0 | 0.003 | 0.026 |
| 2.784000000000005 | 0 | 0.003 | 0.026 |
| 2.788000000000006 | 0 | 0.003 | 0.025 |
| 2.792000000000005 | 0 | 0.003 | 0.025 |
| 2.796000000000005 | 0 | 0.003 | 0.025 |
| 2.800000000000006 | 0 | 0.003 | 0.024 |
| 2.804000000000006 | 0 | 0.003 | 0.024 |
| 2.808000000000006 | 0 | 0.003 | 0.023 |
| 2.812000000000006 | 0 | 0.003 | 0.023 |
| 2.816000000000006 | 0 | 0.003 | 0.023 |
| 2.820000000000006 | 0 | 0.003 | 0.022 |
| 2.824000000000006 | 0 | 0.003 | 0.022 |
| 2.828000000000006 | 0 | 0.003 | 0.022 |
| 2.832000000000006 | 0 | 0.003 | 0.021 |
| 2.836000000000006 | 0 | 0.003 | 0.021 |
| 2.840000000000006 | 0 | 0.003 | 0.02 |
| 2.844000000000006 | 0 | 0.002 | 0.02 |
| 2.848000000000006 | 0 | 0.002 | 0.02 |
| 2.852000000000006 | 0 | 0.002 | 0.019 |
| 2.856000000000006 | 0 | 0.002 | 0.019 |
| 2.860000000000006 | 0 | 0.002 | 0.019 |
| 2.864000000000006 | 0 | 0.002 | 0.018 |
| 2.868000000000006 | 0 | 0.002 | 0.018 |
| 2.872000000000006 | 0 | 0.002 | 0.018 |
| 2.876000000000006 | 0 | 0.002 | 0.017 |
| 2.880000000000006 | 0 | 0.002 | 0.017 |
| 2.884000000000006 | 0 | 0.002 | 0.017 |
| 2.888000000000006 | 0 | 0.002 | 0.017 |
| 2.892000000000006 | 0 | 0.002 | 0.016 |
| 2.896000000000006 | 0 | 0.002 | 0.016 |
| 2.900000000000006 | 0 | 0.002 | 0.016 |
| 2.904000000000006 | 0 | 0.002 | 0.015 |
| 2.908000000000006 | 0 | 0.002 | 0.015 |
| 2.912000000000006 | 0 | 0.002 | 0.015 |
| 2.916000000000006 | 0 | 0.002 | 0.015 |
| 2.920000000000006 | 0 | 0.002 | 0.014 |
| 2.924000000000006 | 0 | 0.002 | 0.014 |
| 2.928000000000006 | 0 | 0.002 | 0.014 |
| 2.932000000000006 | 0 | 0.002 | 0.014 |
| 2.936000000000006 | 0 | 0.002 | 0.013 |
| 2.940000000000006 | 0 | 0.002 | 0.013 |
| 2.944000000000006 | 0 | 0.001 | 0.013 |
| 2.948000000000006 | 0 | 0.001 | 0.013 |
| 2.952000000000006 | 0 | 0.001 | 0.012 |
| 2.956000000000006 | 0 | 0.001 | 0.012 |
| 2.960000000000006 | 0 | 0.001 | 0.012 |
| 2.964000000000006 | 0 | 0.001 | 0.012 |
| 2.968000000000006 | 0 | 0.001 | 0.012 |
| 2.972000000000006 | 0 | 0.001 | 0.011 |
| 2.976000000000006 | 0 | 0.001 | 0.011 |
| 2.980000000000006 | 0 | 0.001 | 0.011 |
| 2.984000000000006 | 0 | 0.001 | 0.011 |
| 2.988000000000006 | 0 | 0.001 | 0.011 |
| 2.992000000000006 | 0 | 0.001 | 0.01 |
| 2.996000000000006 | 0 | 0.001 | 0.01 |
| 3.000000000000006 | 0 | 0.001 | 0.01 |
| 3.004000000000006 | 0 | 0.001 | 0.01 |
| 3.008000000000006 | 0 | 0.001 | 0.01 |
| 3.012000000000006 | 0 | 0.001 | 0.009 |
| 3.016000000000006 | 0 | 0.001 | 0.009 |
| 3.020000000000006 | 0 | 0.001 | 0.009 |
| 3.024000000000006 | 0 | 0.001 | 0.009 |
| 3.028000000000006 | 0 | 0.001 | 0.009 |
| 3.032000000000006 | 0 | 0.001 | 0.009 |
| 3.036000000000006 | 0 | 0.001 | 0.008 |
| 3.040000000000006 | 0 | 0.001 | 0.008 |
| 3.044000000000006 | 0 | 0.001 | 0.008 |
| 3.048000000000006 | 0 | 0.001 | 0.008 |
| 3.052000000000006 | 0 | 0.001 | 0.008 |
| 3.056000000000006 | 0 | 0.001 | 0.008 |
| 3.060000000000006 | 0 | 0.001 | 0.008 |
| 3.064000000000006 | 0 | 0.001 | 0.007 |
| 3.068000000000006 | 0 | 0.001 | 0.007 |
| 3.072000000000006 | 0 | 0.001 | 0.007 |
| 3.076000000000006 | 0 | 0.001 | 0.007 |
| 3.080000000000006 | 0 | 0.001 | 0.007 |
| 3.084000000000006 | 0 | 0.001 | 0.007 |
| 3.088000000000006 | 0 | 0.001 | 0.007 |
| 3.092000000000006 | 0 | 0.001 | 0.006 |
| 3.096000000000006 | 0 | 0.001 | 0.006 |
| 3.100000000000006 | 0 | 0.001 | 0.006 |
| 3.104000000000006 | 0 | 0.001 | 0.006 |
| 3.108000000000006 | 0 | 0.001 | 0.006 |
| 3.112000000000006 | 0 | 0.001 | 0.006 |
| 3.116000000000006 | 0 | 0.001 | 0.006 |
| 3.120000000000006 | 0 | 0.001 | 0.006 |
| 3.124000000000006 | 0 | 0.001 | 0.006 |
| 3.128000000000006 | 0 | 0.001 | 0.005 |
| 3.132000000000006 | 0 | 0.001 | 0.005 |
| 3.136000000000006 | 0 | 0.001 | 0.005 |
| 3.140000000000006 | 0 | 0.001 | 0.005 |
| 3.144000000000006 | 0 | 0.001 | 0.005 |
| 3.148000000000006 | 0 | 0 | 0.005 |
| 3.152000000000006 | 0 | 0 | 0.005 |
| 3.156000000000006 | 0 | 0 | 0.005 |
| 3.160000000000006 | 0 | 0 | 0.005 |
| 3.164000000000006 | 0 | 0 | 0.005 |
| 3.168000000000006 | 0 | 0 | 0.004 |
| 3.172000000000006 | 0 | 0 | 0.004 |
| 3.176000000000006 | 0 | 0 | 0.004 |
| 3.180000000000006 | 0 | 0 | 0.004 |
| 3.184000000000006 | 0 | 0 | 0.004 |
| 3.188000000000006 | 0 | 0 | 0.004 |
| 3.192000000000006 | 0 | 0 | 0.004 |
| 3.196000000000006 | 0 | 0 | 0.004 |
| 3.200000000000006 | 0 | 0 | 0.004 |
| 3.204000000000006 | 0 | 0 | 0.004 |
| 3.208000000000006 | 0 | 0 | 0.004 |
| 3.212000000000006 | 0 | 0 | 0.004 |
| 3.216000000000006 | 0 | 0 | 0.003 |
| 3.220000000000006 | 0 | 0 | 0.003 |
| 3.224000000000006 | 0 | 0 | 0.003 |
| 3.228000000000006 | 0 | 0 | 0.003 |
| 3.232000000000006 | 0 | 0 | 0.003 |
| 3.236000000000006 | 0 | 0 | 0.003 |
| 3.240000000000006 | 0 | 0 | 0.003 |
| 3.244000000000006 | 0 | 0 | 0.003 |
| 3.248000000000006 | 0 | 0 | 0.003 |
| 3.252000000000006 | 0 | 0 | 0.003 |
| 3.256000000000006 | 0 | 0 | 0.003 |
| 3.260000000000006 | 0 | 0 | 0.003 |
| 3.264000000000006 | 0 | 0 | 0.003 |
| 3.268000000000006 | 0 | 0 | 0.003 |
| 3.272000000000006 | 0 | 0 | 0.003 |
| 3.276000000000006 | 0 | 0 | 0.003 |
| 3.280000000000006 | 0 | 0 | 0.002 |
| 3.284000000000006 | 0 | 0 | 0.002 |
| 3.288000000000006 | 0 | 0 | 0.002 |
| 3.292000000000006 | 0 | 0 | 0.002 |
| 3.296000000000006 | 0 | 0 | 0.002 |
| 3.300000000000006 | 0 | 0 | 0.002 |
| 3.304000000000006 | 0 | 0 | 0.002 |
| 3.308000000000006 | 0 | 0 | 0.002 |
| 3.312000000000006 | 0 | 0 | 0.002 |
| 3.316000000000006 | 0 | 0 | 0.002 |
| 3.320000000000006 | 0 | 0 | 0.002 |
| 3.324000000000006 | 0 | 0 | 0.002 |
| 3.328000000000006 | 0 | 0 | 0.002 |
| 3.332000000000006 | 0 | 0 | 0.002 |
| 3.336000000000006 | 0 | 0 | 0.002 |
| 3.340000000000006 | 0 | 0 | 0.002 |
| 3.344000000000006 | 0 | 0 | 0.002 |
| 3.348000000000006 | 0 | 0 | 0.002 |
| 3.352000000000006 | 0 | 0 | 0.002 |
| 3.356000000000006 | 0 | 0 | 0.002 |
| 3.360000000000006 | 0 | 0 | 0.002 |
| 3.364000000000006 | 0 | 0 | 0.002 |
| 3.368000000000006 | 0 | 0 | 0.002 |
| 3.372000000000006 | 0 | 0 | 0.001 |
| 3.376000000000006 | 0 | 0 | 0.001 |
| 3.380000000000006 | 0 | 0 | 0.001 |
| 3.384000000000006 | 0 | 0 | 0.001 |
| 3.388000000000006 | 0 | 0 | 0.001 |
| 3.392000000000006 | 0 | 0 | 0.001 |
| 3.396000000000006 | 0 | 0 | 0.001 |
| 3.400000000000006 | 0 | 0 | 0.001 |
| 3.404000000000006 | 0 | 0 | 0.001 |
| 3.408000000000006 | 0 | 0 | 0.001 |
| 3.412000000000006 | 0 | 0 | 0.001 |
| 3.416000000000006 | 0 | 0 | 0.001 |
| 3.420000000000006 | 0 | 0 | 0.001 |
| 3.424000000000006 | 0 | 0 | 0.001 |
| 3.428000000000006 | 0 | 0 | 0.001 |
| 3.432000000000006 | 0 | 0 | 0.001 |
| 3.436000000000006 | 0 | 0 | 0.001 |
| 3.440000000000006 | 0 | 0 | 0.001 |
| 3.444000000000006 | 0 | 0 | 0.001 |
| 3.448000000000006 | 0 | 0 | 0.001 |
| 3.452000000000006 | 0 | 0 | 0.001 |
| 3.456000000000006 | 0 | 0 | 0.001 |
| 3.460000000000006 | 0 | 0 | 0.001 |
| 3.464000000000006 | 0 | 0 | 0.001 |
| 3.468000000000006 | 0 | 0 | 0.001 |
| 3.472000000000006 | 0 | 0 | 0.001 |
| 3.476000000000006 | 0 | 0 | 0.001 |
| 3.480000000000006 | 0 | 0 | 0.001 |
| 3.484000000000006 | 0 | 0 | 0.001 |
| 3.488000000000006 | 0 | 0 | 0.001 |
| 3.492000000000006 | 0 | 0 | 0.001 |
| 3.496000000000006 | 0 | 0 | 0.001 |
| 3.500000000000006 | 0 | 0 | 0.001 |
| 3.504000000000006 | 0 | 0 | 0.001 |
| 3.508000000000006 | 0 | 0 | 0.001 |
| 3.512000000000006 | 0 | 0 | 0.001 |
| 3.516000000000006 | 0 | 0 | 0.001 |
| 3.520000000000006 | 0 | 0 | 0.001 |
| 3.524000000000006 | 0 | 0 | 0.001 |
| 3.528000000000006 | 0 | 0 | 0.001 |
| 3.532000000000006 | 0 | 0 | 0.001 |
| 3.536000000000006 | 0 | 0 | 0.001 |
| 3.540000000000006 | 0 | 0 | 0.001 |
| 3.544000000000006 | 0 | 0 | 0.001 |
| 3.548000000000006 | 0 | 0 | 0.001 |
| 3.552000000000006 | 0 | 0 | 0.001 |
| 3.556000000000006 | 0 | 0 | 0.001 |
| 3.560000000000006 | 0 | 0 | 0.001 |
| 3.564000000000006 | 0 | 0 | 0 |
| 3.568000000000006 | 0 | 0 | 0 |
| 3.572000000000006 | 0 | 0 | 0 |
| 3.576000000000006 | 0 | 0 | 0 |
| 3.580000000000006 | 0 | 0 | 0 |
| 3.584000000000006 | 0 | 0 | 0 |
| 3.588000000000006 | 0 | 0 | 0 |
| 3.592000000000006 | 0 | 0 | 0 |
| 3.596000000000006 | 0 | 0 | 0 |
| 3.600000000000006 | 0 | 0 | 0 |
| 3.604000000000006 | 0 | 0 | 0 |
| 3.608000000000006 | 0 | 0 | 0 |
| 3.612000000000006 | 0 | 0 | 0 |
| 3.616000000000006 | 0 | 0 | 0 |
| 3.620000000000006 | 0 | 0 | 0 |
| 3.624000000000006 | 0 | 0 | 0 |
| 3.628000000000006 | 0 | 0 | 0 |
| 3.632000000000006 | 0 | 0 | 0 |
| 3.636000000000006 | 0 | 0 | 0 |
| 3.640000000000006 | 0 | 0 | 0 |
| 3.644000000000006 | 0 | 0 | 0 |
| 3.648000000000006 | 0 | 0 | 0 |
| 3.652000000000006 | 0 | 0 | 0 |
| 3.656000000000006 | 0 | 0 | 0 |
| 3.660000000000006 | 0 | 0 | 0 |
| 3.664000000000006 | 0 | 0 | 0 |
| 3.668000000000006 | 0 | 0 | 0 |
| 3.672000000000006 | 0 | 0 | 0 |
| 3.676000000000006 | 0 | 0 | 0 |
| 3.680000000000006 | 0 | 0 | 0 |
| 3.684000000000006 | 0 | 0 | 0 |
| 3.688000000000006 | 0 | 0 | 0 |
| 3.692000000000006 | 0 | 0 | 0 |
| 3.696000000000006 | 0 | 0 | 0 |
| 3.700000000000006 | 0 | 0 | 0 |
| 3.704000000000006 | 0 | 0 | 0 |
| 3.708000000000006 | 0 | 0 | 0 |
| 3.712000000000006 | 0 | 0 | 0 |
| 3.716000000000006 | 0 | 0 | 0 |
| 3.720000000000006 | 0 | 0 | 0 |
| 3.724000000000006 | 0 | 0 | 0 |
| 3.728000000000006 | 0 | 0 | 0 |
| 3.732000000000006 | 0 | 0 | 0 |
| 3.736000000000006 | 0 | 0 | 0 |
| 3.740000000000006 | 0 | 0 | 0 |
| 3.744000000000006 | 0 | 0 | 0 |
| 3.748000000000006 | 0 | 0 | 0 |
| 3.752000000000006 | 0 | 0 | 0 |
| 3.756000000000006 | 0 | 0 | 0 |
| 3.760000000000006 | 0 | 0 | 0 |
| 3.764000000000006 | 0 | 0 | 0 |
| 3.768000000000006 | 0 | 0 | 0 |
| 3.772000000000006 | 0 | 0 | 0 |
| 3.776000000000006 | 0 | 0 | 0 |
| 3.780000000000006 | 0 | 0 | 0 |
| 3.784000000000006 | 0 | 0 | 0 |
| 3.788000000000006 | 0 | 0 | 0 |
| 3.792000000000006 | 0 | 0 | 0 |
| 3.796000000000006 | 0 | 0 | 0 |
| 3.800000000000006 | 0 | 0 | 0 |
| 3.804000000000006 | 0 | 0 | 0 |
| 3.808000000000006 | 0 | 0 | 0 |
| 3.812000000000006 | 0 | 0 | 0 |
| 3.816000000000006 | 0 | 0 | 0 |
| 3.820000000000006 | 0 | 0 | 0 |
| 3.824000000000006 | 0 | 0 | 0 |
| 3.828000000000006 | 0 | 0 | 0 |
| 3.832000000000006 | 0 | 0 | 0 |
| 3.836000000000006 | 0 | 0 | 0 |
| 3.840000000000006 | 0 | 0 | 0 |
| 3.844000000000006 | 0 | 0 | 0 |
| 3.848000000000006 | 0 | 0 | 0 |
| 3.852000000000006 | 0 | 0 | 0 |
| 3.856000000000006 | 0 | 0 | 0 |
| 3.860000000000006 | 0 | 0 | 0 |
| 3.864000000000006 | 0 | 0 | 0 |
| 3.868000000000006 | 0 | 0 | 0 |
| 3.872000000000006 | 0 | 0 | 0 |
| 3.876000000000006 | 0 | 0 | 0 |
| 3.880000000000006 | 0 | 0 | 0 |
| 3.884000000000006 | 0 | 0 | 0 |
| 3.888000000000007 | 0 | 0 | 0 |
| 3.892000000000006 | 0 | 0 | 0 |
| 3.896000000000006 | 0 | 0 | 0 |
| 3.900000000000007 | 0 | 0 | 0 |
| 3.904000000000007 | 0 | 0 | 0 |
| 3.908000000000007 | 0 | 0 | 0 |
| 3.912000000000007 | 0 | 0 | 0 |
| 3.916000000000007 | 0 | 0 | 0 |
| 3.920000000000007 | 0 | 0 | 0 |
| 3.924000000000007 | 0 | 0 | 0 |
| 3.928000000000007 | 0 | 0 | 0 |
| 3.932000000000007 | 0 | 0 | 0 |
| 3.936000000000007 | 0 | 0 | 0 |
| 3.940000000000007 | 0 | 0 | 0 |
| 3.944000000000007 | 0 | 0 | 0 |
| 3.948000000000007 | 0 | 0 | 0 |
| 3.952000000000007 | 0 | 0 | 0 |
| 3.956000000000007 | 0 | 0 | 0 |
| 3.960000000000007 | 0 | 0 | 0 |
| 3.964000000000007 | 0 | 0 | 0 |
| 3.968000000000007 | 0 | 0 | 0 |
| 3.972000000000007 | 0 | 0 | 0 |
| 3.976000000000007 | 0 | 0 | 0 |
| 3.980000000000007 | 0 | 0 | 0 |
| 3.984000000000007 | 0 | 0 | 0 |
| 3.988000000000007 | 0 | 0 | 0 |
| 3.992000000000007 | 0 | 0 | 0 |
| 3.996000000000007 | 0 | 0 | 0 |
| 4.000000000000006 | 0 | 0 | 0 |